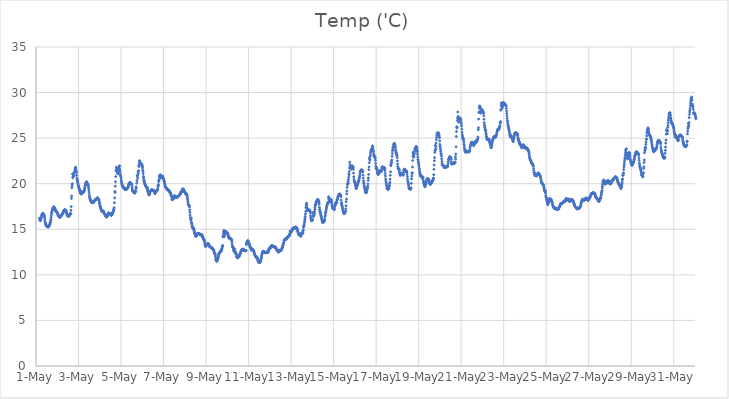
| Category | Temp ('C) |
|---|---|
| 44682.166666666664 | 16.217 |
| 44682.177083333336 | 16.087 |
| 44682.1875 | 16.053 |
| 44682.197916666664 | 15.991 |
| 44682.208333333336 | 15.937 |
| 44682.21875 | 16.111 |
| 44682.229166666664 | 16.195 |
| 44682.239583333336 | 16.241 |
| 44682.25 | 16.258 |
| 44682.260416666664 | 16.443 |
| 44682.270833333336 | 16.519 |
| 44682.28125 | 16.634 |
| 44682.291666666664 | 16.671 |
| 44682.302083333336 | 16.72 |
| 44682.3125 | 16.718 |
| 44682.322916666664 | 16.733 |
| 44682.333333333336 | 16.71 |
| 44682.34375 | 16.676 |
| 44682.354166666664 | 16.561 |
| 44682.364583333336 | 16.571 |
| 44682.375 | 16.574 |
| 44682.385416666664 | 16.514 |
| 44682.395833333336 | 16.415 |
| 44682.40625 | 16.253 |
| 44682.416666666664 | 16.048 |
| 44682.427083333336 | 15.844 |
| 44682.4375 | 15.724 |
| 44682.447916666664 | 15.62 |
| 44682.458333333336 | 15.553 |
| 44682.46875 | 15.486 |
| 44682.479166666664 | 15.424 |
| 44682.489583333336 | 15.369 |
| 44682.5 | 15.337 |
| 44682.510416666664 | 15.315 |
| 44682.520833333336 | 15.302 |
| 44682.53125 | 15.289 |
| 44682.541666666664 | 15.286 |
| 44682.552083333336 | 15.283 |
| 44682.5625 | 15.27 |
| 44682.572916666664 | 15.264 |
| 44682.583333333336 | 15.26 |
| 44682.59375 | 15.307 |
| 44682.604166666664 | 15.419 |
| 44682.614583333336 | 15.358 |
| 44682.625 | 15.433 |
| 44682.635416666664 | 15.427 |
| 44682.645833333336 | 15.54 |
| 44682.65625 | 15.694 |
| 44682.666666666664 | 15.705 |
| 44682.677083333336 | 15.765 |
| 44682.6875 | 15.944 |
| 44682.697916666664 | 16.03 |
| 44682.708333333336 | 16.25 |
| 44682.71875 | 16.477 |
| 44682.729166666664 | 16.7 |
| 44682.739583333336 | 16.812 |
| 44682.75 | 16.957 |
| 44682.760416666664 | 17.117 |
| 44682.770833333336 | 17.099 |
| 44682.78125 | 17.189 |
| 44682.791666666664 | 17.284 |
| 44682.802083333336 | 17.321 |
| 44682.8125 | 17.391 |
| 44682.822916666664 | 17.445 |
| 44682.833333333336 | 17.462 |
| 44682.84375 | 17.425 |
| 44682.854166666664 | 17.398 |
| 44682.864583333336 | 17.356 |
| 44682.875 | 17.303 |
| 44682.885416666664 | 17.277 |
| 44682.895833333336 | 17.224 |
| 44682.90625 | 17.127 |
| 44682.916666666664 | 17.076 |
| 44682.927083333336 | 17.056 |
| 44682.9375 | 17.011 |
| 44682.947916666664 | 16.98 |
| 44682.958333333336 | 16.947 |
| 44682.96875 | 16.905 |
| 44682.979166666664 | 16.879 |
| 44682.989583333336 | 16.84 |
| 44683.0 | 16.816 |
| 44683.010416666664 | 16.743 |
| 44683.020833333336 | 16.682 |
| 44683.03125 | 16.578 |
| 44683.041666666664 | 16.552 |
| 44683.052083333336 | 16.485 |
| 44683.0625 | 16.442 |
| 44683.072916666664 | 16.424 |
| 44683.083333333336 | 16.369 |
| 44683.09375 | 16.367 |
| 44683.104166666664 | 16.349 |
| 44683.114583333336 | 16.303 |
| 44683.125 | 16.312 |
| 44683.135416666664 | 16.409 |
| 44683.145833333336 | 16.38 |
| 44683.15625 | 16.522 |
| 44683.166666666664 | 16.487 |
| 44683.177083333336 | 16.527 |
| 44683.1875 | 16.458 |
| 44683.197916666664 | 16.556 |
| 44683.208333333336 | 16.577 |
| 44683.21875 | 16.623 |
| 44683.229166666664 | 16.618 |
| 44683.239583333336 | 16.644 |
| 44683.25 | 16.699 |
| 44683.260416666664 | 16.732 |
| 44683.270833333336 | 16.806 |
| 44683.28125 | 16.866 |
| 44683.291666666664 | 16.941 |
| 44683.302083333336 | 17.006 |
| 44683.3125 | 17.04 |
| 44683.322916666664 | 17.092 |
| 44683.333333333336 | 17.121 |
| 44683.34375 | 17.141 |
| 44683.354166666664 | 17.137 |
| 44683.364583333336 | 17.141 |
| 44683.375 | 17.093 |
| 44683.385416666664 | 17.061 |
| 44683.395833333336 | 17.081 |
| 44683.40625 | 17.048 |
| 44683.416666666664 | 17.006 |
| 44683.427083333336 | 16.947 |
| 44683.4375 | 16.845 |
| 44683.447916666664 | 16.719 |
| 44683.458333333336 | 16.631 |
| 44683.46875 | 16.581 |
| 44683.479166666664 | 16.523 |
| 44683.489583333336 | 16.469 |
| 44683.5 | 16.45 |
| 44683.510416666664 | 16.444 |
| 44683.520833333336 | 16.436 |
| 44683.53125 | 16.439 |
| 44683.541666666664 | 16.448 |
| 44683.552083333336 | 16.465 |
| 44683.5625 | 16.477 |
| 44683.572916666664 | 16.497 |
| 44683.583333333336 | 16.539 |
| 44683.59375 | 16.599 |
| 44683.604166666664 | 16.688 |
| 44683.614583333336 | 16.727 |
| 44683.625 | 16.702 |
| 44683.635416666664 | 16.723 |
| 44683.645833333336 | 17.082 |
| 44683.65625 | 17.487 |
| 44683.666666666664 | 18.376 |
| 44683.677083333336 | 18.644 |
| 44683.6875 | 19.553 |
| 44683.697916666664 | 19.805 |
| 44683.708333333336 | 19.993 |
| 44683.71875 | 21.07 |
| 44683.729166666664 | 20.65 |
| 44683.739583333336 | 21.065 |
| 44683.75 | 20.812 |
| 44683.760416666664 | 20.781 |
| 44683.770833333336 | 20.817 |
| 44683.78125 | 20.878 |
| 44683.791666666664 | 21.066 |
| 44683.802083333336 | 21.201 |
| 44683.8125 | 21.275 |
| 44683.822916666664 | 21.385 |
| 44683.833333333336 | 21.524 |
| 44683.84375 | 21.64 |
| 44683.854166666664 | 21.783 |
| 44683.864583333336 | 21.799 |
| 44683.875 | 21.592 |
| 44683.885416666664 | 21.466 |
| 44683.895833333336 | 21.29 |
| 44683.90625 | 21.221 |
| 44683.916666666664 | 20.902 |
| 44683.927083333336 | 20.578 |
| 44683.9375 | 20.457 |
| 44683.947916666664 | 20.353 |
| 44683.958333333336 | 20.187 |
| 44683.96875 | 20.077 |
| 44683.979166666664 | 19.957 |
| 44683.989583333336 | 19.818 |
| 44684.0 | 19.705 |
| 44684.010416666664 | 19.645 |
| 44684.020833333336 | 19.535 |
| 44684.03125 | 19.468 |
| 44684.041666666664 | 19.411 |
| 44684.052083333336 | 19.324 |
| 44684.0625 | 19.237 |
| 44684.072916666664 | 19.154 |
| 44684.083333333336 | 19.046 |
| 44684.09375 | 18.972 |
| 44684.104166666664 | 18.913 |
| 44684.114583333336 | 18.885 |
| 44684.125 | 18.877 |
| 44684.135416666664 | 18.879 |
| 44684.145833333336 | 18.977 |
| 44684.15625 | 19.132 |
| 44684.166666666664 | 19.06 |
| 44684.177083333336 | 19.061 |
| 44684.1875 | 19.089 |
| 44684.197916666664 | 19.077 |
| 44684.208333333336 | 18.993 |
| 44684.21875 | 19.036 |
| 44684.229166666664 | 19.067 |
| 44684.239583333336 | 19.109 |
| 44684.25 | 19.16 |
| 44684.260416666664 | 19.217 |
| 44684.270833333336 | 19.238 |
| 44684.28125 | 19.37 |
| 44684.291666666664 | 19.511 |
| 44684.302083333336 | 19.639 |
| 44684.3125 | 19.776 |
| 44684.322916666664 | 19.886 |
| 44684.333333333336 | 19.979 |
| 44684.34375 | 20.083 |
| 44684.354166666664 | 20.063 |
| 44684.364583333336 | 20.126 |
| 44684.375 | 20.2 |
| 44684.385416666664 | 20.198 |
| 44684.395833333336 | 20.183 |
| 44684.40625 | 20.066 |
| 44684.416666666664 | 19.972 |
| 44684.427083333336 | 19.972 |
| 44684.4375 | 19.963 |
| 44684.447916666664 | 19.902 |
| 44684.458333333336 | 19.803 |
| 44684.46875 | 19.636 |
| 44684.479166666664 | 19.439 |
| 44684.489583333336 | 19.215 |
| 44684.5 | 18.979 |
| 44684.510416666664 | 18.724 |
| 44684.520833333336 | 18.551 |
| 44684.53125 | 18.45 |
| 44684.541666666664 | 18.368 |
| 44684.552083333336 | 18.285 |
| 44684.5625 | 18.204 |
| 44684.572916666664 | 18.146 |
| 44684.583333333336 | 18.093 |
| 44684.59375 | 18.042 |
| 44684.604166666664 | 17.983 |
| 44684.614583333336 | 17.934 |
| 44684.625 | 18.015 |
| 44684.635416666664 | 18.077 |
| 44684.645833333336 | 17.945 |
| 44684.65625 | 17.937 |
| 44684.666666666664 | 17.922 |
| 44684.677083333336 | 17.95 |
| 44684.6875 | 17.912 |
| 44684.697916666664 | 17.933 |
| 44684.708333333336 | 17.986 |
| 44684.71875 | 18.021 |
| 44684.729166666664 | 18.054 |
| 44684.739583333336 | 18.102 |
| 44684.75 | 18.13 |
| 44684.760416666664 | 18.169 |
| 44684.770833333336 | 18.193 |
| 44684.78125 | 18.206 |
| 44684.791666666664 | 18.229 |
| 44684.802083333336 | 18.245 |
| 44684.8125 | 18.252 |
| 44684.822916666664 | 18.283 |
| 44684.833333333336 | 18.313 |
| 44684.84375 | 18.328 |
| 44684.854166666664 | 18.363 |
| 44684.864583333336 | 18.395 |
| 44684.875 | 18.416 |
| 44684.885416666664 | 18.468 |
| 44684.895833333336 | 18.453 |
| 44684.90625 | 18.397 |
| 44684.916666666664 | 18.323 |
| 44684.927083333336 | 18.333 |
| 44684.9375 | 18.329 |
| 44684.947916666664 | 18.264 |
| 44684.958333333336 | 18.188 |
| 44684.96875 | 18.106 |
| 44684.979166666664 | 17.971 |
| 44684.989583333336 | 17.835 |
| 44685.0 | 17.699 |
| 44685.010416666664 | 17.579 |
| 44685.020833333336 | 17.482 |
| 44685.03125 | 17.4 |
| 44685.041666666664 | 17.33 |
| 44685.052083333336 | 17.263 |
| 44685.0625 | 17.182 |
| 44685.072916666664 | 17.103 |
| 44685.083333333336 | 17.057 |
| 44685.09375 | 17.031 |
| 44685.104166666664 | 16.994 |
| 44685.114583333336 | 16.966 |
| 44685.125 | 16.965 |
| 44685.135416666664 | 16.941 |
| 44685.145833333336 | 16.937 |
| 44685.15625 | 16.929 |
| 44685.166666666664 | 16.951 |
| 44685.177083333336 | 16.999 |
| 44685.1875 | 16.879 |
| 44685.197916666664 | 16.816 |
| 44685.208333333336 | 16.747 |
| 44685.21875 | 16.685 |
| 44685.229166666664 | 16.646 |
| 44685.239583333336 | 16.652 |
| 44685.25 | 16.597 |
| 44685.260416666664 | 16.529 |
| 44685.270833333336 | 16.522 |
| 44685.28125 | 16.45 |
| 44685.291666666664 | 16.413 |
| 44685.302083333336 | 16.38 |
| 44685.3125 | 16.346 |
| 44685.322916666664 | 16.365 |
| 44685.333333333336 | 16.37 |
| 44685.34375 | 16.405 |
| 44685.354166666664 | 16.401 |
| 44685.364583333336 | 16.481 |
| 44685.375 | 16.641 |
| 44685.385416666664 | 16.697 |
| 44685.395833333336 | 16.709 |
| 44685.40625 | 16.765 |
| 44685.416666666664 | 16.778 |
| 44685.427083333336 | 16.776 |
| 44685.4375 | 16.781 |
| 44685.447916666664 | 16.732 |
| 44685.458333333336 | 16.72 |
| 44685.46875 | 16.728 |
| 44685.479166666664 | 16.713 |
| 44685.489583333336 | 16.687 |
| 44685.5 | 16.656 |
| 44685.510416666664 | 16.616 |
| 44685.520833333336 | 16.571 |
| 44685.53125 | 16.549 |
| 44685.541666666664 | 16.546 |
| 44685.552083333336 | 16.56 |
| 44685.5625 | 16.573 |
| 44685.572916666664 | 16.607 |
| 44685.583333333336 | 16.654 |
| 44685.59375 | 16.727 |
| 44685.604166666664 | 16.794 |
| 44685.614583333336 | 16.854 |
| 44685.625 | 16.919 |
| 44685.635416666664 | 16.976 |
| 44685.645833333336 | 17.071 |
| 44685.65625 | 17.207 |
| 44685.666666666664 | 17.203 |
| 44685.677083333336 | 17.373 |
| 44685.6875 | 17.909 |
| 44685.697916666664 | 18.443 |
| 44685.708333333336 | 19.143 |
| 44685.71875 | 19.042 |
| 44685.729166666664 | 19.732 |
| 44685.739583333336 | 20.216 |
| 44685.75 | 20.787 |
| 44685.760416666664 | 21.424 |
| 44685.770833333336 | 21.459 |
| 44685.78125 | 21.803 |
| 44685.791666666664 | 21.485 |
| 44685.802083333336 | 21.682 |
| 44685.8125 | 21.681 |
| 44685.822916666664 | 21.183 |
| 44685.833333333336 | 21.316 |
| 44685.84375 | 21.394 |
| 44685.854166666664 | 21.083 |
| 44685.864583333336 | 21.405 |
| 44685.875 | 21.364 |
| 44685.885416666664 | 21.637 |
| 44685.895833333336 | 21.751 |
| 44685.90625 | 21.912 |
| 44685.916666666664 | 21.898 |
| 44685.927083333336 | 21.965 |
| 44685.9375 | 21.623 |
| 44685.947916666664 | 21.411 |
| 44685.958333333336 | 21.153 |
| 44685.96875 | 20.947 |
| 44685.979166666664 | 20.88 |
| 44685.989583333336 | 20.788 |
| 44686.0 | 20.602 |
| 44686.010416666664 | 20.391 |
| 44686.020833333336 | 20.213 |
| 44686.03125 | 20.09 |
| 44686.041666666664 | 19.977 |
| 44686.052083333336 | 19.883 |
| 44686.0625 | 19.809 |
| 44686.072916666664 | 19.726 |
| 44686.083333333336 | 19.688 |
| 44686.09375 | 19.644 |
| 44686.104166666664 | 19.613 |
| 44686.114583333336 | 19.597 |
| 44686.125 | 19.573 |
| 44686.135416666664 | 19.551 |
| 44686.145833333336 | 19.518 |
| 44686.15625 | 19.422 |
| 44686.166666666664 | 19.391 |
| 44686.177083333336 | 19.374 |
| 44686.1875 | 19.354 |
| 44686.197916666664 | 19.421 |
| 44686.208333333336 | 19.389 |
| 44686.21875 | 19.45 |
| 44686.229166666664 | 19.355 |
| 44686.239583333336 | 19.375 |
| 44686.25 | 19.379 |
| 44686.260416666664 | 19.434 |
| 44686.270833333336 | 19.432 |
| 44686.28125 | 19.495 |
| 44686.291666666664 | 19.467 |
| 44686.302083333336 | 19.485 |
| 44686.3125 | 19.558 |
| 44686.322916666664 | 19.617 |
| 44686.333333333336 | 19.627 |
| 44686.34375 | 19.755 |
| 44686.354166666664 | 19.84 |
| 44686.364583333336 | 19.93 |
| 44686.375 | 19.98 |
| 44686.385416666664 | 20.069 |
| 44686.395833333336 | 20.082 |
| 44686.40625 | 20.075 |
| 44686.416666666664 | 20.088 |
| 44686.427083333336 | 20.101 |
| 44686.4375 | 20.102 |
| 44686.447916666664 | 20.093 |
| 44686.458333333336 | 20.061 |
| 44686.46875 | 19.997 |
| 44686.479166666664 | 19.985 |
| 44686.489583333336 | 19.965 |
| 44686.5 | 19.926 |
| 44686.510416666664 | 19.824 |
| 44686.520833333336 | 19.578 |
| 44686.53125 | 19.41 |
| 44686.541666666664 | 19.271 |
| 44686.552083333336 | 19.182 |
| 44686.5625 | 19.138 |
| 44686.572916666664 | 19.151 |
| 44686.583333333336 | 19.116 |
| 44686.59375 | 19.08 |
| 44686.604166666664 | 19.036 |
| 44686.614583333336 | 19.001 |
| 44686.625 | 19.007 |
| 44686.635416666664 | 18.97 |
| 44686.645833333336 | 18.976 |
| 44686.65625 | 19.019 |
| 44686.666666666664 | 19.168 |
| 44686.677083333336 | 19.181 |
| 44686.6875 | 19.138 |
| 44686.697916666664 | 19.414 |
| 44686.708333333336 | 19.659 |
| 44686.71875 | 19.553 |
| 44686.739583333336 | 20.066 |
| 44686.75 | 20.34 |
| 44686.760416666664 | 20.87 |
| 44686.770833333336 | 20.87 |
| 44686.78125 | 20.619 |
| 44686.791666666664 | 20.956 |
| 44686.802083333336 | 21.319 |
| 44686.8125 | 21.136 |
| 44686.822916666664 | 21.424 |
| 44686.833333333336 | 21.959 |
| 44686.84375 | 21.895 |
| 44686.854166666664 | 22.182 |
| 44686.864583333336 | 22.51 |
| 44686.875 | 22.516 |
| 44686.885416666664 | 22.381 |
| 44686.895833333336 | 22.26 |
| 44686.90625 | 22.284 |
| 44686.916666666664 | 22.25 |
| 44686.927083333336 | 22.252 |
| 44686.9375 | 22.22 |
| 44686.947916666664 | 22.197 |
| 44686.958333333336 | 22.138 |
| 44686.96875 | 22.093 |
| 44686.979166666664 | 22.079 |
| 44686.989583333336 | 22.009 |
| 44687.0 | 21.911 |
| 44687.010416666664 | 21.748 |
| 44687.020833333336 | 21.513 |
| 44687.03125 | 21.35 |
| 44687.041666666664 | 21.103 |
| 44687.052083333336 | 20.803 |
| 44687.0625 | 20.655 |
| 44687.072916666664 | 20.479 |
| 44687.083333333336 | 20.354 |
| 44687.09375 | 20.241 |
| 44687.104166666664 | 20.112 |
| 44687.114583333336 | 20.037 |
| 44687.125 | 19.965 |
| 44687.135416666664 | 19.885 |
| 44687.145833333336 | 19.839 |
| 44687.15625 | 19.773 |
| 44687.166666666664 | 19.721 |
| 44687.177083333336 | 19.677 |
| 44687.1875 | 19.635 |
| 44687.197916666664 | 19.625 |
| 44687.208333333336 | 19.608 |
| 44687.21875 | 19.439 |
| 44687.229166666664 | 19.614 |
| 44687.239583333336 | 19.501 |
| 44687.25 | 19.342 |
| 44687.260416666664 | 19.207 |
| 44687.270833333336 | 19.125 |
| 44687.28125 | 19.047 |
| 44687.291666666664 | 18.959 |
| 44687.302083333336 | 18.889 |
| 44687.3125 | 18.81 |
| 44687.322916666664 | 18.763 |
| 44687.333333333336 | 18.811 |
| 44687.34375 | 18.952 |
| 44687.354166666664 | 18.871 |
| 44687.364583333336 | 19.135 |
| 44687.375 | 19.135 |
| 44687.385416666664 | 19.166 |
| 44687.395833333336 | 19.182 |
| 44687.40625 | 19.219 |
| 44687.416666666664 | 19.253 |
| 44687.427083333336 | 19.319 |
| 44687.4375 | 19.335 |
| 44687.447916666664 | 19.307 |
| 44687.458333333336 | 19.295 |
| 44687.46875 | 19.312 |
| 44687.479166666664 | 19.271 |
| 44687.489583333336 | 19.304 |
| 44687.5 | 19.286 |
| 44687.510416666664 | 19.276 |
| 44687.520833333336 | 19.26 |
| 44687.53125 | 19.251 |
| 44687.541666666664 | 19.231 |
| 44687.552083333336 | 19.214 |
| 44687.5625 | 19.141 |
| 44687.572916666664 | 19.08 |
| 44687.583333333336 | 18.988 |
| 44687.59375 | 18.938 |
| 44687.604166666664 | 18.948 |
| 44687.614583333336 | 18.997 |
| 44687.625 | 19.096 |
| 44687.635416666664 | 19.128 |
| 44687.645833333336 | 19.149 |
| 44687.65625 | 19.172 |
| 44687.666666666664 | 19.222 |
| 44687.677083333336 | 19.257 |
| 44687.6875 | 19.28 |
| 44687.697916666664 | 19.302 |
| 44687.708333333336 | 19.3 |
| 44687.71875 | 19.295 |
| 44687.729166666664 | 19.467 |
| 44687.739583333336 | 19.686 |
| 44687.75 | 19.796 |
| 44687.760416666664 | 19.914 |
| 44687.770833333336 | 20.241 |
| 44687.78125 | 20.315 |
| 44687.791666666664 | 20.462 |
| 44687.802083333336 | 20.73 |
| 44687.8125 | 20.909 |
| 44687.822916666664 | 20.81 |
| 44687.833333333336 | 20.847 |
| 44687.84375 | 20.991 |
| 44687.854166666664 | 20.897 |
| 44687.864583333336 | 20.645 |
| 44687.875 | 20.743 |
| 44687.885416666664 | 20.702 |
| 44687.895833333336 | 20.779 |
| 44687.90625 | 20.781 |
| 44687.916666666664 | 20.793 |
| 44687.927083333336 | 20.824 |
| 44687.9375 | 20.834 |
| 44687.947916666664 | 20.824 |
| 44687.958333333336 | 20.736 |
| 44687.96875 | 20.693 |
| 44687.979166666664 | 20.651 |
| 44687.989583333336 | 20.575 |
| 44688.0 | 20.485 |
| 44688.010416666664 | 20.433 |
| 44688.020833333336 | 20.307 |
| 44688.03125 | 20.259 |
| 44688.041666666664 | 20.18 |
| 44688.052083333336 | 20.036 |
| 44688.0625 | 19.879 |
| 44688.072916666664 | 19.782 |
| 44688.083333333336 | 19.649 |
| 44688.09375 | 19.61 |
| 44688.104166666664 | 19.576 |
| 44688.114583333336 | 19.566 |
| 44688.125 | 19.535 |
| 44688.135416666664 | 19.498 |
| 44688.145833333336 | 19.461 |
| 44688.15625 | 19.431 |
| 44688.166666666664 | 19.396 |
| 44688.177083333336 | 19.376 |
| 44688.1875 | 19.357 |
| 44688.197916666664 | 19.337 |
| 44688.208333333336 | 19.317 |
| 44688.21875 | 19.299 |
| 44688.229166666664 | 19.298 |
| 44688.239583333336 | 19.279 |
| 44688.25 | 19.263 |
| 44688.260416666664 | 19.216 |
| 44688.270833333336 | 19.208 |
| 44688.28125 | 19.084 |
| 44688.291666666664 | 19.107 |
| 44688.302083333336 | 19.029 |
| 44688.3125 | 18.983 |
| 44688.322916666664 | 19.018 |
| 44688.333333333336 | 18.935 |
| 44688.34375 | 18.812 |
| 44688.354166666664 | 18.729 |
| 44688.364583333336 | 18.66 |
| 44688.375 | 18.677 |
| 44688.385416666664 | 18.532 |
| 44688.395833333336 | 18.272 |
| 44688.40625 | 18.249 |
| 44688.416666666664 | 18.246 |
| 44688.427083333336 | 18.413 |
| 44688.4375 | 18.325 |
| 44688.447916666664 | 18.363 |
| 44688.458333333336 | 18.391 |
| 44688.46875 | 18.467 |
| 44688.479166666664 | 18.36 |
| 44688.489583333336 | 18.564 |
| 44688.5 | 18.653 |
| 44688.510416666664 | 18.682 |
| 44688.520833333336 | 18.662 |
| 44688.53125 | 18.601 |
| 44688.541666666664 | 18.602 |
| 44688.552083333336 | 18.598 |
| 44688.5625 | 18.592 |
| 44688.572916666664 | 18.547 |
| 44688.583333333336 | 18.524 |
| 44688.59375 | 18.5 |
| 44688.604166666664 | 18.51 |
| 44688.614583333336 | 18.533 |
| 44688.625 | 18.533 |
| 44688.635416666664 | 18.558 |
| 44688.645833333336 | 18.579 |
| 44688.65625 | 18.577 |
| 44688.666666666664 | 18.575 |
| 44688.677083333336 | 18.581 |
| 44688.6875 | 18.601 |
| 44688.697916666664 | 18.634 |
| 44688.708333333336 | 18.657 |
| 44688.71875 | 18.681 |
| 44688.729166666664 | 18.711 |
| 44688.739583333336 | 18.74 |
| 44688.75 | 18.782 |
| 44688.760416666664 | 18.836 |
| 44688.770833333336 | 18.855 |
| 44688.78125 | 18.848 |
| 44688.791666666664 | 18.856 |
| 44688.802083333336 | 18.98 |
| 44688.8125 | 19.005 |
| 44688.822916666664 | 19.119 |
| 44688.833333333336 | 19.105 |
| 44688.84375 | 19.097 |
| 44688.854166666664 | 19.092 |
| 44688.864583333336 | 19.202 |
| 44688.875 | 19.217 |
| 44688.885416666664 | 19.396 |
| 44688.895833333336 | 19.385 |
| 44688.90625 | 19.378 |
| 44688.916666666664 | 19.342 |
| 44688.927083333336 | 19.417 |
| 44688.9375 | 19.391 |
| 44688.947916666664 | 19.313 |
| 44688.958333333336 | 19.25 |
| 44688.96875 | 19.213 |
| 44688.979166666664 | 19.175 |
| 44688.989583333336 | 19.087 |
| 44689.0 | 19.04 |
| 44689.010416666664 | 19.019 |
| 44689.020833333336 | 18.986 |
| 44689.03125 | 18.941 |
| 44689.041666666664 | 18.882 |
| 44689.052083333336 | 18.87 |
| 44689.0625 | 18.867 |
| 44689.072916666664 | 18.864 |
| 44689.083333333336 | 18.836 |
| 44689.09375 | 18.808 |
| 44689.104166666664 | 18.748 |
| 44689.114583333336 | 18.575 |
| 44689.125 | 18.402 |
| 44689.135416666664 | 18.231 |
| 44689.145833333336 | 18.056 |
| 44689.15625 | 17.868 |
| 44689.166666666664 | 17.732 |
| 44689.177083333336 | 17.663 |
| 44689.1875 | 17.664 |
| 44689.197916666664 | 17.625 |
| 44689.208333333336 | 17.56 |
| 44689.21875 | 17.45 |
| 44689.229166666664 | 17.123 |
| 44689.239583333336 | 16.854 |
| 44689.25 | 16.565 |
| 44689.260416666664 | 16.295 |
| 44689.270833333336 | 16.049 |
| 44689.28125 | 16.064 |
| 44689.291666666664 | 16.246 |
| 44689.302083333336 | 16.194 |
| 44689.3125 | 15.788 |
| 44689.322916666664 | 15.665 |
| 44689.333333333336 | 15.548 |
| 44689.34375 | 15.357 |
| 44689.354166666664 | 15.328 |
| 44689.364583333336 | 15.221 |
| 44689.375 | 15.161 |
| 44689.385416666664 | 15.119 |
| 44689.395833333336 | 15.099 |
| 44689.40625 | 15.147 |
| 44689.416666666664 | 15.105 |
| 44689.427083333336 | 15.02 |
| 44689.4375 | 14.873 |
| 44689.447916666664 | 14.745 |
| 44689.458333333336 | 14.648 |
| 44689.46875 | 14.533 |
| 44689.479166666664 | 14.428 |
| 44689.489583333336 | 14.385 |
| 44689.5 | 14.317 |
| 44689.510416666664 | 14.228 |
| 44689.520833333336 | 14.272 |
| 44689.53125 | 14.276 |
| 44689.541666666664 | 14.376 |
| 44689.552083333336 | 14.27 |
| 44689.5625 | 14.456 |
| 44689.572916666664 | 14.464 |
| 44689.583333333336 | 14.518 |
| 44689.59375 | 14.505 |
| 44689.604166666664 | 14.493 |
| 44689.614583333336 | 14.538 |
| 44689.625 | 14.523 |
| 44689.635416666664 | 14.553 |
| 44689.645833333336 | 14.542 |
| 44689.65625 | 14.556 |
| 44689.666666666664 | 14.515 |
| 44689.677083333336 | 14.467 |
| 44689.6875 | 14.465 |
| 44689.697916666664 | 14.467 |
| 44689.708333333336 | 14.448 |
| 44689.71875 | 14.465 |
| 44689.729166666664 | 14.456 |
| 44689.739583333336 | 14.409 |
| 44689.75 | 14.378 |
| 44689.760416666664 | 14.386 |
| 44689.770833333336 | 14.4 |
| 44689.78125 | 14.42 |
| 44689.791666666664 | 14.413 |
| 44689.802083333336 | 14.397 |
| 44689.8125 | 14.329 |
| 44689.822916666664 | 14.284 |
| 44689.833333333336 | 14.137 |
| 44689.84375 | 14.148 |
| 44689.854166666664 | 14.117 |
| 44689.864583333336 | 13.988 |
| 44689.875 | 13.891 |
| 44689.885416666664 | 13.902 |
| 44689.895833333336 | 13.866 |
| 44689.90625 | 13.816 |
| 44689.916666666664 | 13.812 |
| 44689.927083333336 | 13.693 |
| 44689.9375 | 13.55 |
| 44689.947916666664 | 13.336 |
| 44689.958333333336 | 13.293 |
| 44689.96875 | 13.199 |
| 44689.979166666664 | 13.108 |
| 44689.989583333336 | 13.135 |
| 44690.0 | 13.267 |
| 44690.010416666664 | 13.214 |
| 44690.020833333336 | 13.257 |
| 44690.03125 | 13.282 |
| 44690.041666666664 | 13.278 |
| 44690.052083333336 | 13.395 |
| 44690.0625 | 13.359 |
| 44690.072916666664 | 13.397 |
| 44690.083333333336 | 13.405 |
| 44690.09375 | 13.422 |
| 44690.104166666664 | 13.418 |
| 44690.114583333336 | 13.42 |
| 44690.125 | 13.38 |
| 44690.135416666664 | 13.332 |
| 44690.145833333336 | 13.236 |
| 44690.15625 | 13.169 |
| 44690.166666666664 | 13.116 |
| 44690.177083333336 | 13.066 |
| 44690.1875 | 13.043 |
| 44690.197916666664 | 13.105 |
| 44690.208333333336 | 13.083 |
| 44690.21875 | 13.04 |
| 44690.229166666664 | 13.019 |
| 44690.239583333336 | 13.019 |
| 44690.25 | 13.011 |
| 44690.260416666664 | 12.98 |
| 44690.270833333336 | 12.957 |
| 44690.28125 | 12.933 |
| 44690.291666666664 | 12.906 |
| 44690.302083333336 | 12.88 |
| 44690.3125 | 12.81 |
| 44690.322916666664 | 12.802 |
| 44690.333333333336 | 12.833 |
| 44690.34375 | 12.784 |
| 44690.354166666664 | 12.692 |
| 44690.364583333336 | 12.632 |
| 44690.375 | 12.595 |
| 44690.385416666664 | 12.426 |
| 44690.395833333336 | 12.368 |
| 44690.40625 | 12.362 |
| 44690.416666666664 | 12.306 |
| 44690.427083333336 | 12.239 |
| 44690.4375 | 12.088 |
| 44690.447916666664 | 11.932 |
| 44690.458333333336 | 11.731 |
| 44690.46875 | 11.631 |
| 44690.479166666664 | 11.578 |
| 44690.489583333336 | 11.609 |
| 44690.5 | 11.462 |
| 44690.510416666664 | 11.612 |
| 44690.520833333336 | 11.566 |
| 44690.53125 | 11.604 |
| 44690.541666666664 | 11.634 |
| 44690.552083333336 | 11.798 |
| 44690.5625 | 11.849 |
| 44690.572916666664 | 11.94 |
| 44690.583333333336 | 12.077 |
| 44690.59375 | 12.24 |
| 44690.604166666664 | 12.309 |
| 44690.614583333336 | 12.366 |
| 44690.625 | 12.418 |
| 44690.635416666664 | 12.442 |
| 44690.645833333336 | 12.475 |
| 44690.65625 | 12.465 |
| 44690.666666666664 | 12.498 |
| 44690.677083333336 | 12.563 |
| 44690.6875 | 12.594 |
| 44690.697916666664 | 12.577 |
| 44690.708333333336 | 12.607 |
| 44690.71875 | 12.661 |
| 44690.729166666664 | 12.783 |
| 44690.739583333336 | 12.838 |
| 44690.75 | 12.93 |
| 44690.760416666664 | 13.053 |
| 44690.770833333336 | 13.163 |
| 44690.78125 | 13.224 |
| 44690.791666666664 | 14.172 |
| 44690.802083333336 | 14.177 |
| 44690.8125 | 14.365 |
| 44690.822916666664 | 14.589 |
| 44690.833333333336 | 14.767 |
| 44690.84375 | 14.857 |
| 44690.854166666664 | 14.825 |
| 44690.864583333336 | 14.212 |
| 44690.875 | 14.586 |
| 44690.885416666664 | 14.442 |
| 44690.895833333336 | 14.612 |
| 44690.90625 | 14.711 |
| 44690.916666666664 | 14.769 |
| 44690.927083333336 | 14.744 |
| 44690.9375 | 14.734 |
| 44690.947916666664 | 14.693 |
| 44690.958333333336 | 14.651 |
| 44690.96875 | 14.652 |
| 44690.979166666664 | 14.569 |
| 44690.989583333336 | 14.623 |
| 44691.0 | 14.589 |
| 44691.010416666664 | 14.571 |
| 44691.020833333336 | 14.524 |
| 44691.03125 | 14.405 |
| 44691.041666666664 | 14.281 |
| 44691.052083333336 | 14.265 |
| 44691.0625 | 14.087 |
| 44691.072916666664 | 14.087 |
| 44691.083333333336 | 14.174 |
| 44691.09375 | 14.022 |
| 44691.104166666664 | 14.01 |
| 44691.114583333336 | 13.967 |
| 44691.125 | 13.961 |
| 44691.135416666664 | 13.991 |
| 44691.145833333336 | 13.963 |
| 44691.15625 | 13.934 |
| 44691.166666666664 | 13.931 |
| 44691.177083333336 | 13.929 |
| 44691.1875 | 13.895 |
| 44691.197916666664 | 13.862 |
| 44691.208333333336 | 13.77 |
| 44691.21875 | 13.554 |
| 44691.229166666664 | 13.308 |
| 44691.239583333336 | 13.079 |
| 44691.25 | 13.087 |
| 44691.260416666664 | 13.081 |
| 44691.270833333336 | 13.012 |
| 44691.28125 | 12.918 |
| 44691.291666666664 | 12.815 |
| 44691.302083333336 | 12.7 |
| 44691.3125 | 12.645 |
| 44691.322916666664 | 12.552 |
| 44691.333333333336 | 12.515 |
| 44691.34375 | 12.866 |
| 44691.354166666664 | 12.573 |
| 44691.364583333336 | 12.655 |
| 44691.375 | 12.493 |
| 44691.385416666664 | 12.337 |
| 44691.395833333336 | 12.403 |
| 44691.40625 | 12.358 |
| 44691.416666666664 | 12.341 |
| 44691.427083333336 | 12.207 |
| 44691.4375 | 12.006 |
| 44691.447916666664 | 11.976 |
| 44691.458333333336 | 11.89 |
| 44691.46875 | 12.008 |
| 44691.479166666664 | 11.915 |
| 44691.489583333336 | 11.85 |
| 44691.5 | 11.906 |
| 44691.510416666664 | 11.918 |
| 44691.520833333336 | 11.941 |
| 44691.53125 | 11.972 |
| 44691.541666666664 | 11.984 |
| 44691.552083333336 | 12.022 |
| 44691.5625 | 12.077 |
| 44691.572916666664 | 12.154 |
| 44691.583333333336 | 12.216 |
| 44691.59375 | 12.257 |
| 44691.604166666664 | 12.326 |
| 44691.614583333336 | 12.404 |
| 44691.625 | 12.472 |
| 44691.635416666664 | 12.522 |
| 44691.645833333336 | 12.605 |
| 44691.65625 | 12.645 |
| 44691.666666666664 | 12.722 |
| 44691.677083333336 | 12.765 |
| 44691.6875 | 12.763 |
| 44691.697916666664 | 12.814 |
| 44691.708333333336 | 12.75 |
| 44691.71875 | 12.773 |
| 44691.729166666664 | 12.784 |
| 44691.739583333336 | 12.794 |
| 44691.75 | 12.814 |
| 44691.760416666664 | 12.806 |
| 44691.770833333336 | 12.737 |
| 44691.78125 | 12.668 |
| 44691.791666666664 | 12.664 |
| 44691.802083333336 | 12.684 |
| 44691.8125 | 12.672 |
| 44691.822916666664 | 12.66 |
| 44691.833333333336 | 12.679 |
| 44691.84375 | 12.672 |
| 44691.854166666664 | 12.652 |
| 44691.864583333336 | 12.66 |
| 44691.875 | 12.671 |
| 44691.885416666664 | 12.671 |
| 44691.895833333336 | 13.308 |
| 44691.90625 | 13.448 |
| 44691.916666666664 | 13.525 |
| 44691.927083333336 | 13.597 |
| 44691.9375 | 13.632 |
| 44691.947916666664 | 13.692 |
| 44691.958333333336 | 13.754 |
| 44691.96875 | 13.739 |
| 44691.979166666664 | 13.526 |
| 44691.989583333336 | 13.663 |
| 44692.0 | 13.422 |
| 44692.010416666664 | 13.426 |
| 44692.020833333336 | 13.407 |
| 44692.03125 | 13.355 |
| 44692.041666666664 | 13.377 |
| 44692.052083333336 | 13.177 |
| 44692.0625 | 13.091 |
| 44692.072916666664 | 13.059 |
| 44692.083333333336 | 12.958 |
| 44692.09375 | 13.011 |
| 44692.104166666664 | 12.998 |
| 44692.114583333336 | 12.886 |
| 44692.125 | 12.846 |
| 44692.135416666664 | 12.749 |
| 44692.145833333336 | 12.771 |
| 44692.15625 | 12.694 |
| 44692.166666666664 | 12.801 |
| 44692.177083333336 | 12.813 |
| 44692.1875 | 12.769 |
| 44692.197916666664 | 12.74 |
| 44692.208333333336 | 12.747 |
| 44692.21875 | 12.716 |
| 44692.229166666664 | 12.684 |
| 44692.239583333336 | 12.639 |
| 44692.25 | 12.586 |
| 44692.260416666664 | 12.448 |
| 44692.270833333336 | 12.38 |
| 44692.28125 | 12.261 |
| 44692.291666666664 | 12.209 |
| 44692.302083333336 | 12.156 |
| 44692.3125 | 12.085 |
| 44692.322916666664 | 12.052 |
| 44692.333333333336 | 12.013 |
| 44692.34375 | 11.981 |
| 44692.354166666664 | 11.951 |
| 44692.364583333336 | 11.908 |
| 44692.375 | 11.874 |
| 44692.385416666664 | 11.98 |
| 44692.395833333336 | 11.915 |
| 44692.40625 | 11.889 |
| 44692.416666666664 | 11.794 |
| 44692.427083333336 | 11.682 |
| 44692.4375 | 11.561 |
| 44692.447916666664 | 11.505 |
| 44692.458333333336 | 11.405 |
| 44692.46875 | 11.494 |
| 44692.479166666664 | 11.492 |
| 44692.489583333336 | 11.382 |
| 44692.5 | 11.361 |
| 44692.510416666664 | 11.507 |
| 44692.520833333336 | 11.518 |
| 44692.53125 | 11.343 |
| 44692.541666666664 | 11.389 |
| 44692.552083333336 | 11.459 |
| 44692.5625 | 11.53 |
| 44692.572916666664 | 11.595 |
| 44692.583333333336 | 11.717 |
| 44692.59375 | 11.819 |
| 44692.604166666664 | 11.925 |
| 44692.614583333336 | 12.062 |
| 44692.625 | 12.18 |
| 44692.635416666664 | 12.303 |
| 44692.645833333336 | 12.363 |
| 44692.65625 | 12.484 |
| 44692.666666666664 | 12.52 |
| 44692.677083333336 | 12.569 |
| 44692.6875 | 12.486 |
| 44692.697916666664 | 12.547 |
| 44692.708333333336 | 12.584 |
| 44692.71875 | 12.523 |
| 44692.729166666664 | 12.514 |
| 44692.739583333336 | 12.511 |
| 44692.75 | 12.499 |
| 44692.760416666664 | 12.458 |
| 44692.770833333336 | 12.461 |
| 44692.78125 | 12.452 |
| 44692.791666666664 | 12.43 |
| 44692.802083333336 | 12.431 |
| 44692.8125 | 12.447 |
| 44692.822916666664 | 12.46 |
| 44692.833333333336 | 12.481 |
| 44692.84375 | 12.493 |
| 44692.854166666664 | 12.494 |
| 44692.864583333336 | 12.489 |
| 44692.875 | 12.485 |
| 44692.885416666664 | 12.487 |
| 44692.895833333336 | 12.488 |
| 44692.90625 | 12.489 |
| 44692.916666666664 | 12.483 |
| 44692.927083333336 | 12.49 |
| 44692.9375 | 12.641 |
| 44692.947916666664 | 12.728 |
| 44692.958333333336 | 12.793 |
| 44692.96875 | 12.896 |
| 44692.979166666664 | 12.886 |
| 44692.989583333336 | 12.91 |
| 44693.0 | 12.926 |
| 44693.010416666664 | 12.912 |
| 44693.020833333336 | 12.983 |
| 44693.03125 | 13.024 |
| 44693.041666666664 | 13.045 |
| 44693.052083333336 | 13.041 |
| 44693.0625 | 13.173 |
| 44693.072916666664 | 13.181 |
| 44693.083333333336 | 13.183 |
| 44693.09375 | 13.175 |
| 44693.104166666664 | 13.197 |
| 44693.114583333336 | 13.172 |
| 44693.125 | 13.192 |
| 44693.135416666664 | 13.181 |
| 44693.145833333336 | 13.163 |
| 44693.15625 | 13.144 |
| 44693.166666666664 | 13.105 |
| 44693.177083333336 | 13.084 |
| 44693.1875 | 13.078 |
| 44693.197916666664 | 13.073 |
| 44693.208333333336 | 13.078 |
| 44693.21875 | 13.077 |
| 44693.229166666664 | 13.068 |
| 44693.239583333336 | 13.061 |
| 44693.25 | 13.049 |
| 44693.260416666664 | 13.034 |
| 44693.270833333336 | 13.015 |
| 44693.28125 | 12.978 |
| 44693.291666666664 | 12.898 |
| 44693.302083333336 | 12.834 |
| 44693.3125 | 12.792 |
| 44693.322916666664 | 12.752 |
| 44693.333333333336 | 12.693 |
| 44693.34375 | 12.675 |
| 44693.354166666664 | 12.643 |
| 44693.364583333336 | 12.622 |
| 44693.375 | 12.588 |
| 44693.385416666664 | 12.538 |
| 44693.395833333336 | 12.502 |
| 44693.40625 | 12.483 |
| 44693.416666666664 | 12.577 |
| 44693.427083333336 | 12.69 |
| 44693.4375 | 12.723 |
| 44693.447916666664 | 12.661 |
| 44693.458333333336 | 12.674 |
| 44693.46875 | 12.631 |
| 44693.479166666664 | 12.671 |
| 44693.489583333336 | 12.655 |
| 44693.5 | 12.649 |
| 44693.510416666664 | 12.661 |
| 44693.520833333336 | 12.689 |
| 44693.53125 | 12.72 |
| 44693.541666666664 | 12.725 |
| 44693.552083333336 | 12.747 |
| 44693.5625 | 12.852 |
| 44693.572916666664 | 12.891 |
| 44693.583333333336 | 13.003 |
| 44693.59375 | 13.065 |
| 44693.604166666664 | 13.172 |
| 44693.614583333336 | 13.21 |
| 44693.625 | 13.287 |
| 44693.635416666664 | 13.39 |
| 44693.645833333336 | 13.464 |
| 44693.65625 | 13.544 |
| 44693.666666666664 | 13.732 |
| 44693.677083333336 | 13.785 |
| 44693.6875 | 13.831 |
| 44693.697916666664 | 13.887 |
| 44693.708333333336 | 13.855 |
| 44693.71875 | 13.884 |
| 44693.729166666664 | 13.962 |
| 44693.739583333336 | 13.965 |
| 44693.75 | 13.895 |
| 44693.760416666664 | 13.935 |
| 44693.770833333336 | 13.931 |
| 44693.78125 | 13.942 |
| 44693.791666666664 | 13.971 |
| 44693.802083333336 | 14.02 |
| 44693.8125 | 14.058 |
| 44693.822916666664 | 14.094 |
| 44693.833333333336 | 14.115 |
| 44693.84375 | 14.164 |
| 44693.854166666664 | 14.194 |
| 44693.864583333336 | 14.21 |
| 44693.875 | 14.239 |
| 44693.885416666664 | 14.25 |
| 44693.895833333336 | 14.251 |
| 44693.90625 | 14.254 |
| 44693.916666666664 | 14.339 |
| 44693.927083333336 | 14.349 |
| 44693.9375 | 14.539 |
| 44693.947916666664 | 14.79 |
| 44693.958333333336 | 14.569 |
| 44693.96875 | 14.571 |
| 44693.979166666664 | 14.816 |
| 44693.989583333336 | 14.678 |
| 44694.0 | 14.765 |
| 44694.010416666664 | 14.733 |
| 44694.020833333336 | 14.802 |
| 44694.03125 | 14.83 |
| 44694.041666666664 | 14.906 |
| 44694.052083333336 | 14.947 |
| 44694.0625 | 14.955 |
| 44694.072916666664 | 15.05 |
| 44694.083333333336 | 15.134 |
| 44694.09375 | 15.092 |
| 44694.104166666664 | 15.087 |
| 44694.114583333336 | 15.077 |
| 44694.125 | 15.122 |
| 44694.135416666664 | 15.155 |
| 44694.145833333336 | 15.149 |
| 44694.15625 | 15.138 |
| 44694.166666666664 | 15.139 |
| 44694.177083333336 | 15.104 |
| 44694.1875 | 15.145 |
| 44694.197916666664 | 15.211 |
| 44694.208333333336 | 15.23 |
| 44694.21875 | 15.239 |
| 44694.229166666664 | 15.25 |
| 44694.239583333336 | 15.2 |
| 44694.25 | 15.172 |
| 44694.260416666664 | 15.167 |
| 44694.270833333336 | 15.13 |
| 44694.28125 | 15.056 |
| 44694.291666666664 | 15.017 |
| 44694.302083333336 | 14.879 |
| 44694.3125 | 14.75 |
| 44694.322916666664 | 14.698 |
| 44694.333333333336 | 14.628 |
| 44694.34375 | 14.533 |
| 44694.354166666664 | 14.46 |
| 44694.364583333336 | 14.423 |
| 44694.375 | 14.398 |
| 44694.385416666664 | 14.373 |
| 44694.395833333336 | 14.344 |
| 44694.40625 | 14.343 |
| 44694.416666666664 | 14.34 |
| 44694.427083333336 | 14.327 |
| 44694.4375 | 14.3 |
| 44694.447916666664 | 14.291 |
| 44694.458333333336 | 14.265 |
| 44694.46875 | 14.243 |
| 44694.479166666664 | 14.544 |
| 44694.489583333336 | 14.545 |
| 44694.5 | 14.623 |
| 44694.510416666664 | 14.548 |
| 44694.520833333336 | 14.549 |
| 44694.53125 | 14.558 |
| 44694.541666666664 | 14.521 |
| 44694.552083333336 | 14.644 |
| 44694.5625 | 14.833 |
| 44694.572916666664 | 14.917 |
| 44694.583333333336 | 15.204 |
| 44694.59375 | 15.341 |
| 44694.604166666664 | 15.391 |
| 44694.614583333336 | 15.475 |
| 44694.625 | 15.694 |
| 44694.635416666664 | 15.84 |
| 44694.645833333336 | 16 |
| 44694.65625 | 16.179 |
| 44694.666666666664 | 16.414 |
| 44694.677083333336 | 16.682 |
| 44694.6875 | 16.957 |
| 44694.697916666664 | 17.387 |
| 44694.708333333336 | 17.663 |
| 44694.71875 | 17.763 |
| 44694.729166666664 | 17.861 |
| 44694.739583333336 | 17.57 |
| 44694.75 | 17.351 |
| 44694.760416666664 | 17.186 |
| 44694.770833333336 | 17.197 |
| 44694.78125 | 17.149 |
| 44694.791666666664 | 17.061 |
| 44694.802083333336 | 17.085 |
| 44694.8125 | 17.124 |
| 44694.822916666664 | 17.11 |
| 44694.833333333336 | 17.118 |
| 44694.84375 | 17.118 |
| 44694.854166666664 | 17.074 |
| 44694.864583333336 | 17.062 |
| 44694.875 | 17.07 |
| 44694.885416666664 | 17.032 |
| 44694.895833333336 | 16.962 |
| 44694.90625 | 16.785 |
| 44694.916666666664 | 16.482 |
| 44694.927083333336 | 16.284 |
| 44694.9375 | 16.137 |
| 44694.947916666664 | 16.066 |
| 44694.958333333336 | 15.95 |
| 44694.96875 | 15.935 |
| 44694.979166666664 | 15.948 |
| 44694.989583333336 | 15.953 |
| 44695.0 | 15.973 |
| 44695.010416666664 | 16.097 |
| 44695.020833333336 | 16.771 |
| 44695.03125 | 16.838 |
| 44695.041666666664 | 16.43 |
| 44695.052083333336 | 16.518 |
| 44695.0625 | 16.429 |
| 44695.072916666664 | 16.532 |
| 44695.083333333336 | 16.655 |
| 44695.09375 | 16.714 |
| 44695.104166666664 | 16.937 |
| 44695.114583333336 | 17.164 |
| 44695.125 | 17.368 |
| 44695.135416666664 | 17.606 |
| 44695.145833333336 | 17.642 |
| 44695.15625 | 17.716 |
| 44695.166666666664 | 17.842 |
| 44695.177083333336 | 17.924 |
| 44695.1875 | 18.012 |
| 44695.197916666664 | 18.046 |
| 44695.208333333336 | 18.064 |
| 44695.21875 | 18.113 |
| 44695.229166666664 | 18.215 |
| 44695.239583333336 | 18.267 |
| 44695.25 | 18.272 |
| 44695.260416666664 | 18.244 |
| 44695.270833333336 | 18.188 |
| 44695.28125 | 18.159 |
| 44695.291666666664 | 18.124 |
| 44695.302083333336 | 18.059 |
| 44695.3125 | 17.964 |
| 44695.322916666664 | 17.751 |
| 44695.333333333336 | 17.408 |
| 44695.34375 | 17.193 |
| 44695.354166666664 | 17.061 |
| 44695.364583333336 | 16.927 |
| 44695.375 | 16.867 |
| 44695.385416666664 | 16.715 |
| 44695.395833333336 | 16.59 |
| 44695.40625 | 16.503 |
| 44695.416666666664 | 16.386 |
| 44695.427083333336 | 16.276 |
| 44695.4375 | 16.159 |
| 44695.447916666664 | 16.024 |
| 44695.458333333336 | 15.921 |
| 44695.46875 | 15.805 |
| 44695.479166666664 | 15.772 |
| 44695.489583333336 | 15.739 |
| 44695.5 | 15.713 |
| 44695.510416666664 | 15.961 |
| 44695.520833333336 | 16.008 |
| 44695.53125 | 15.85 |
| 44695.541666666664 | 15.944 |
| 44695.552083333336 | 15.894 |
| 44695.5625 | 15.916 |
| 44695.572916666664 | 15.937 |
| 44695.583333333336 | 16.072 |
| 44695.59375 | 16.363 |
| 44695.604166666664 | 16.496 |
| 44695.614583333336 | 16.716 |
| 44695.625 | 16.873 |
| 44695.635416666664 | 16.979 |
| 44695.645833333336 | 17.111 |
| 44695.65625 | 17.243 |
| 44695.666666666664 | 17.398 |
| 44695.677083333336 | 17.467 |
| 44695.6875 | 17.586 |
| 44695.697916666664 | 17.665 |
| 44695.708333333336 | 17.778 |
| 44695.71875 | 17.862 |
| 44695.729166666664 | 17.881 |
| 44695.739583333336 | 17.932 |
| 44695.75 | 17.993 |
| 44695.760416666664 | 18.574 |
| 44695.770833333336 | 18.421 |
| 44695.78125 | 18.29 |
| 44695.791666666664 | 18.296 |
| 44695.802083333336 | 18.253 |
| 44695.8125 | 18.102 |
| 44695.822916666664 | 17.998 |
| 44695.833333333336 | 18.138 |
| 44695.84375 | 18.308 |
| 44695.854166666664 | 18.288 |
| 44695.864583333336 | 18.277 |
| 44695.875 | 18.276 |
| 44695.885416666664 | 18.215 |
| 44695.895833333336 | 18.139 |
| 44695.90625 | 17.973 |
| 44695.916666666664 | 17.764 |
| 44695.927083333336 | 17.561 |
| 44695.9375 | 17.468 |
| 44695.947916666664 | 17.348 |
| 44695.958333333336 | 17.306 |
| 44695.96875 | 17.278 |
| 44695.979166666664 | 17.277 |
| 44695.989583333336 | 17.27 |
| 44696.0 | 17.254 |
| 44696.010416666664 | 17.232 |
| 44696.020833333336 | 17.199 |
| 44696.03125 | 17.168 |
| 44696.041666666664 | 17.191 |
| 44696.052083333336 | 17.464 |
| 44696.0625 | 17.678 |
| 44696.072916666664 | 17.595 |
| 44696.083333333336 | 17.682 |
| 44696.09375 | 17.835 |
| 44696.104166666664 | 17.903 |
| 44696.114583333336 | 17.934 |
| 44696.125 | 17.857 |
| 44696.135416666664 | 17.89 |
| 44696.145833333336 | 17.981 |
| 44696.15625 | 18.119 |
| 44696.166666666664 | 18.249 |
| 44696.177083333336 | 18.286 |
| 44696.1875 | 18.386 |
| 44696.197916666664 | 18.428 |
| 44696.208333333336 | 18.581 |
| 44696.21875 | 18.618 |
| 44696.229166666664 | 18.699 |
| 44696.239583333336 | 18.743 |
| 44696.25 | 18.791 |
| 44696.260416666664 | 18.794 |
| 44696.270833333336 | 18.833 |
| 44696.28125 | 18.87 |
| 44696.291666666664 | 18.878 |
| 44696.302083333336 | 18.797 |
| 44696.3125 | 18.768 |
| 44696.322916666664 | 18.749 |
| 44696.333333333336 | 18.704 |
| 44696.34375 | 18.573 |
| 44696.354166666664 | 18.205 |
| 44696.364583333336 | 17.93 |
| 44696.375 | 17.81 |
| 44696.385416666664 | 17.678 |
| 44696.395833333336 | 17.59 |
| 44696.40625 | 17.49 |
| 44696.416666666664 | 17.341 |
| 44696.427083333336 | 17.25 |
| 44696.4375 | 17.099 |
| 44696.447916666664 | 16.97 |
| 44696.458333333336 | 16.897 |
| 44696.46875 | 16.829 |
| 44696.479166666664 | 16.761 |
| 44696.489583333336 | 16.728 |
| 44696.5 | 16.715 |
| 44696.510416666664 | 16.726 |
| 44696.520833333336 | 16.775 |
| 44696.53125 | 16.818 |
| 44696.541666666664 | 16.908 |
| 44696.552083333336 | 16.935 |
| 44696.5625 | 17.003 |
| 44696.572916666664 | 17.256 |
| 44696.583333333336 | 17.579 |
| 44696.59375 | 18.03 |
| 44696.604166666664 | 18.313 |
| 44696.614583333336 | 18.888 |
| 44696.625 | 19.194 |
| 44696.635416666664 | 19.59 |
| 44696.645833333336 | 19.966 |
| 44696.65625 | 19.9 |
| 44696.666666666664 | 20.001 |
| 44696.677083333336 | 20.257 |
| 44696.6875 | 20.068 |
| 44696.697916666664 | 20.47 |
| 44696.708333333336 | 20.714 |
| 44696.71875 | 21.099 |
| 44696.729166666664 | 20.967 |
| 44696.739583333336 | 21.341 |
| 44696.75 | 21.724 |
| 44696.760416666664 | 22.354 |
| 44696.770833333336 | 22.062 |
| 44696.78125 | 21.929 |
| 44696.791666666664 | 22.01 |
| 44696.802083333336 | 21.885 |
| 44696.8125 | 21.691 |
| 44696.822916666664 | 21.621 |
| 44696.833333333336 | 21.6 |
| 44696.84375 | 21.673 |
| 44696.854166666664 | 21.716 |
| 44696.864583333336 | 21.857 |
| 44696.875 | 21.894 |
| 44696.885416666664 | 21.935 |
| 44696.895833333336 | 21.928 |
| 44696.90625 | 21.889 |
| 44696.916666666664 | 21.758 |
| 44696.927083333336 | 21.577 |
| 44696.9375 | 21.163 |
| 44696.947916666664 | 20.769 |
| 44696.958333333336 | 20.506 |
| 44696.96875 | 20.32 |
| 44696.979166666664 | 20.222 |
| 44696.989583333336 | 20.199 |
| 44697.0 | 20.167 |
| 44697.010416666664 | 20.075 |
| 44697.020833333336 | 19.975 |
| 44697.03125 | 19.783 |
| 44697.041666666664 | 19.68 |
| 44697.052083333336 | 19.534 |
| 44697.0625 | 19.457 |
| 44697.072916666664 | 19.53 |
| 44697.083333333336 | 19.689 |
| 44697.09375 | 19.722 |
| 44697.104166666664 | 19.783 |
| 44697.114583333336 | 19.913 |
| 44697.125 | 19.896 |
| 44697.135416666664 | 19.985 |
| 44697.145833333336 | 20.105 |
| 44697.15625 | 20.195 |
| 44697.166666666664 | 20.247 |
| 44697.177083333336 | 20.355 |
| 44697.1875 | 20.388 |
| 44697.197916666664 | 20.538 |
| 44697.208333333336 | 20.635 |
| 44697.21875 | 20.747 |
| 44697.229166666664 | 20.882 |
| 44697.239583333336 | 21.073 |
| 44697.25 | 21.255 |
| 44697.260416666664 | 21.371 |
| 44697.270833333336 | 21.393 |
| 44697.28125 | 21.466 |
| 44697.291666666664 | 21.485 |
| 44697.302083333336 | 21.514 |
| 44697.3125 | 21.525 |
| 44697.322916666664 | 21.536 |
| 44697.333333333336 | 21.473 |
| 44697.34375 | 21.433 |
| 44697.354166666664 | 21.437 |
| 44697.364583333336 | 21.385 |
| 44697.375 | 21.289 |
| 44697.385416666664 | 20.954 |
| 44697.395833333336 | 20.63 |
| 44697.40625 | 20.325 |
| 44697.416666666664 | 20.147 |
| 44697.427083333336 | 20 |
| 44697.4375 | 19.81 |
| 44697.447916666664 | 19.677 |
| 44697.458333333336 | 19.544 |
| 44697.46875 | 19.384 |
| 44697.479166666664 | 19.28 |
| 44697.489583333336 | 19.179 |
| 44697.5 | 19.081 |
| 44697.510416666664 | 19.015 |
| 44697.520833333336 | 19 |
| 44697.53125 | 19.01 |
| 44697.541666666664 | 19.051 |
| 44697.552083333336 | 19.121 |
| 44697.5625 | 19.198 |
| 44697.572916666664 | 19.36 |
| 44697.583333333336 | 19.44 |
| 44697.59375 | 19.578 |
| 44697.604166666664 | 19.708 |
| 44697.614583333336 | 19.971 |
| 44697.625 | 20.369 |
| 44697.635416666664 | 20.634 |
| 44697.645833333336 | 21.023 |
| 44697.65625 | 21.537 |
| 44697.666666666664 | 21.843 |
| 44697.677083333336 | 22.313 |
| 44697.6875 | 22.811 |
| 44697.697916666664 | 22.666 |
| 44697.708333333336 | 22.6 |
| 44697.71875 | 22.993 |
| 44697.729166666664 | 23.155 |
| 44697.739583333336 | 23.403 |
| 44697.75 | 23.567 |
| 44697.760416666664 | 23.719 |
| 44697.770833333336 | 23.742 |
| 44697.78125 | 23.701 |
| 44697.791666666664 | 23.654 |
| 44697.802083333336 | 23.745 |
| 44697.8125 | 23.9 |
| 44697.822916666664 | 24.121 |
| 44697.833333333336 | 24.139 |
| 44697.84375 | 23.957 |
| 44697.854166666664 | 23.769 |
| 44697.864583333336 | 23.658 |
| 44697.875 | 23.515 |
| 44697.885416666664 | 23.269 |
| 44697.895833333336 | 23.116 |
| 44697.90625 | 23.05 |
| 44697.916666666664 | 22.988 |
| 44697.927083333336 | 22.936 |
| 44697.9375 | 22.935 |
| 44697.947916666664 | 22.9 |
| 44697.958333333336 | 22.777 |
| 44697.96875 | 22.56 |
| 44697.979166666664 | 22.231 |
| 44697.989583333336 | 21.915 |
| 44698.0 | 21.709 |
| 44698.010416666664 | 21.667 |
| 44698.020833333336 | 21.711 |
| 44698.03125 | 21.685 |
| 44698.041666666664 | 21.549 |
| 44698.052083333336 | 21.404 |
| 44698.0625 | 21.262 |
| 44698.072916666664 | 21.142 |
| 44698.083333333336 | 21.09 |
| 44698.09375 | 21.043 |
| 44698.104166666664 | 21.007 |
| 44698.114583333336 | 21.242 |
| 44698.125 | 21.145 |
| 44698.135416666664 | 21.196 |
| 44698.145833333336 | 21.253 |
| 44698.15625 | 21.258 |
| 44698.166666666664 | 21.274 |
| 44698.177083333336 | 21.356 |
| 44698.1875 | 21.453 |
| 44698.197916666664 | 21.465 |
| 44698.208333333336 | 21.447 |
| 44698.21875 | 21.421 |
| 44698.229166666664 | 21.397 |
| 44698.239583333336 | 21.324 |
| 44698.25 | 21.417 |
| 44698.260416666664 | 21.508 |
| 44698.270833333336 | 21.718 |
| 44698.28125 | 21.852 |
| 44698.291666666664 | 21.799 |
| 44698.302083333336 | 21.828 |
| 44698.3125 | 21.833 |
| 44698.322916666664 | 21.793 |
| 44698.333333333336 | 21.779 |
| 44698.34375 | 21.779 |
| 44698.354166666664 | 21.676 |
| 44698.364583333336 | 21.773 |
| 44698.375 | 21.659 |
| 44698.385416666664 | 21.727 |
| 44698.395833333336 | 21.722 |
| 44698.40625 | 21.681 |
| 44698.416666666664 | 21.446 |
| 44698.427083333336 | 21.134 |
| 44698.4375 | 20.854 |
| 44698.447916666664 | 20.544 |
| 44698.458333333336 | 20.324 |
| 44698.46875 | 20.179 |
| 44698.479166666664 | 20.019 |
| 44698.489583333336 | 19.865 |
| 44698.5 | 19.747 |
| 44698.510416666664 | 19.56 |
| 44698.520833333336 | 19.489 |
| 44698.53125 | 19.487 |
| 44698.541666666664 | 19.451 |
| 44698.552083333336 | 19.406 |
| 44698.5625 | 19.371 |
| 44698.572916666664 | 19.396 |
| 44698.583333333336 | 19.434 |
| 44698.59375 | 19.498 |
| 44698.604166666664 | 19.644 |
| 44698.614583333336 | 19.775 |
| 44698.625 | 19.765 |
| 44698.635416666664 | 19.994 |
| 44698.645833333336 | 20.15 |
| 44698.65625 | 20.496 |
| 44698.666666666664 | 20.916 |
| 44698.677083333336 | 21.31 |
| 44698.6875 | 22.063 |
| 44698.697916666664 | 21.969 |
| 44698.708333333336 | 22.434 |
| 44698.71875 | 22.226 |
| 44698.729166666664 | 22.323 |
| 44698.739583333336 | 22.608 |
| 44698.75 | 23.013 |
| 44698.760416666664 | 23.328 |
| 44698.770833333336 | 23.612 |
| 44698.78125 | 23.767 |
| 44698.791666666664 | 23.973 |
| 44698.802083333336 | 23.992 |
| 44698.8125 | 24.076 |
| 44698.822916666664 | 24.251 |
| 44698.833333333336 | 24.291 |
| 44698.84375 | 24.37 |
| 44698.854166666664 | 24.408 |
| 44698.864583333336 | 24.429 |
| 44698.875 | 24.342 |
| 44698.885416666664 | 24.216 |
| 44698.895833333336 | 24.13 |
| 44698.90625 | 23.963 |
| 44698.916666666664 | 23.716 |
| 44698.927083333336 | 23.573 |
| 44698.9375 | 23.448 |
| 44698.947916666664 | 23.342 |
| 44698.958333333336 | 23.256 |
| 44698.96875 | 23.164 |
| 44698.979166666664 | 23.073 |
| 44698.989583333336 | 22.872 |
| 44699.0 | 22.511 |
| 44699.010416666664 | 22.167 |
| 44699.020833333336 | 21.887 |
| 44699.03125 | 21.731 |
| 44699.041666666664 | 21.635 |
| 44699.052083333336 | 21.595 |
| 44699.0625 | 21.604 |
| 44699.072916666664 | 21.602 |
| 44699.083333333336 | 21.554 |
| 44699.09375 | 21.401 |
| 44699.104166666664 | 21.23 |
| 44699.114583333336 | 21.08 |
| 44699.125 | 21.014 |
| 44699.135416666664 | 20.902 |
| 44699.145833333336 | 21.096 |
| 44699.15625 | 21.053 |
| 44699.166666666664 | 21.013 |
| 44699.177083333336 | 21.13 |
| 44699.1875 | 21.121 |
| 44699.197916666664 | 21.141 |
| 44699.208333333336 | 21.133 |
| 44699.21875 | 21.143 |
| 44699.229166666664 | 21.118 |
| 44699.239583333336 | 21.11 |
| 44699.25 | 21.07 |
| 44699.260416666664 | 21.004 |
| 44699.270833333336 | 20.926 |
| 44699.28125 | 21.018 |
| 44699.291666666664 | 21.242 |
| 44699.302083333336 | 21.464 |
| 44699.3125 | 21.555 |
| 44699.322916666664 | 21.602 |
| 44699.333333333336 | 21.527 |
| 44699.34375 | 21.564 |
| 44699.354166666664 | 21.522 |
| 44699.364583333336 | 21.514 |
| 44699.375 | 21.337 |
| 44699.385416666664 | 21.397 |
| 44699.395833333336 | 21.42 |
| 44699.40625 | 21.344 |
| 44699.416666666664 | 21.309 |
| 44699.427083333336 | 21.358 |
| 44699.4375 | 21.351 |
| 44699.447916666664 | 21.296 |
| 44699.458333333336 | 21.068 |
| 44699.46875 | 20.812 |
| 44699.479166666664 | 20.542 |
| 44699.489583333336 | 20.313 |
| 44699.5 | 20.182 |
| 44699.510416666664 | 20.082 |
| 44699.520833333336 | 19.929 |
| 44699.53125 | 19.765 |
| 44699.541666666664 | 19.604 |
| 44699.552083333336 | 19.47 |
| 44699.5625 | 19.44 |
| 44699.572916666664 | 19.501 |
| 44699.583333333336 | 19.497 |
| 44699.59375 | 19.471 |
| 44699.604166666664 | 19.428 |
| 44699.614583333336 | 19.444 |
| 44699.625 | 19.417 |
| 44699.635416666664 | 19.421 |
| 44699.645833333336 | 19.546 |
| 44699.65625 | 20.042 |
| 44699.666666666664 | 20.525 |
| 44699.677083333336 | 20.834 |
| 44699.6875 | 21.113 |
| 44699.697916666664 | 21.21 |
| 44699.708333333336 | 21.828 |
| 44699.71875 | 22.549 |
| 44699.729166666664 | 23.02 |
| 44699.739583333336 | 23.364 |
| 44699.75 | 23.445 |
| 44699.760416666664 | 23.176 |
| 44699.770833333336 | 22.895 |
| 44699.78125 | 23.138 |
| 44699.791666666664 | 23.323 |
| 44699.802083333336 | 23.335 |
| 44699.8125 | 23.577 |
| 44699.822916666664 | 23.772 |
| 44699.833333333336 | 23.82 |
| 44699.84375 | 23.92 |
| 44699.854166666664 | 23.885 |
| 44699.864583333336 | 23.973 |
| 44699.875 | 24.019 |
| 44699.885416666664 | 24.077 |
| 44699.895833333336 | 24.048 |
| 44699.90625 | 23.962 |
| 44699.916666666664 | 23.848 |
| 44699.927083333336 | 23.682 |
| 44699.9375 | 23.511 |
| 44699.947916666664 | 23.23 |
| 44699.958333333336 | 22.932 |
| 44699.96875 | 22.656 |
| 44699.979166666664 | 22.472 |
| 44699.989583333336 | 22.34 |
| 44700.0 | 22.189 |
| 44700.010416666664 | 21.999 |
| 44700.020833333336 | 21.826 |
| 44700.03125 | 21.656 |
| 44700.041666666664 | 21.444 |
| 44700.052083333336 | 21.232 |
| 44700.0625 | 21.076 |
| 44700.072916666664 | 20.933 |
| 44700.083333333336 | 20.881 |
| 44700.09375 | 20.887 |
| 44700.104166666664 | 20.924 |
| 44700.114583333336 | 20.919 |
| 44700.125 | 20.894 |
| 44700.135416666664 | 20.816 |
| 44700.145833333336 | 20.784 |
| 44700.15625 | 20.69 |
| 44700.166666666664 | 20.591 |
| 44700.177083333336 | 20.643 |
| 44700.1875 | 20.766 |
| 44700.197916666664 | 20.637 |
| 44700.208333333336 | 20.584 |
| 44700.21875 | 20.31 |
| 44700.229166666664 | 20.234 |
| 44700.239583333336 | 20.108 |
| 44700.25 | 20.023 |
| 44700.260416666664 | 19.89 |
| 44700.270833333336 | 19.835 |
| 44700.28125 | 19.758 |
| 44700.291666666664 | 19.67 |
| 44700.302083333336 | 19.672 |
| 44700.3125 | 19.816 |
| 44700.322916666664 | 19.869 |
| 44700.333333333336 | 19.882 |
| 44700.34375 | 20.057 |
| 44700.354166666664 | 20.094 |
| 44700.364583333336 | 20.269 |
| 44700.375 | 20.39 |
| 44700.385416666664 | 20.474 |
| 44700.395833333336 | 20.524 |
| 44700.40625 | 20.528 |
| 44700.416666666664 | 20.557 |
| 44700.427083333336 | 20.538 |
| 44700.4375 | 20.492 |
| 44700.447916666664 | 20.461 |
| 44700.458333333336 | 20.505 |
| 44700.46875 | 20.476 |
| 44700.479166666664 | 20.416 |
| 44700.489583333336 | 20.32 |
| 44700.5 | 20.18 |
| 44700.510416666664 | 20.066 |
| 44700.520833333336 | 19.999 |
| 44700.53125 | 19.967 |
| 44700.541666666664 | 19.965 |
| 44700.552083333336 | 19.961 |
| 44700.5625 | 19.962 |
| 44700.572916666664 | 19.968 |
| 44700.583333333336 | 20.009 |
| 44700.59375 | 20.065 |
| 44700.604166666664 | 20.129 |
| 44700.614583333336 | 20.176 |
| 44700.625 | 20.214 |
| 44700.635416666664 | 20.233 |
| 44700.645833333336 | 20.263 |
| 44700.65625 | 20.314 |
| 44700.666666666664 | 20.379 |
| 44700.677083333336 | 20.46 |
| 44700.6875 | 20.56 |
| 44700.697916666664 | 20.622 |
| 44700.708333333336 | 20.994 |
| 44700.71875 | 21.578 |
| 44700.729166666664 | 22.056 |
| 44700.739583333336 | 22.524 |
| 44700.75 | 22.869 |
| 44700.760416666664 | 23.452 |
| 44700.770833333336 | 23.611 |
| 44700.78125 | 24.195 |
| 44700.791666666664 | 23.721 |
| 44700.802083333336 | 23.866 |
| 44700.8125 | 24.115 |
| 44700.822916666664 | 24.452 |
| 44700.833333333336 | 24.829 |
| 44700.84375 | 25.105 |
| 44700.854166666664 | 25.305 |
| 44700.864583333336 | 25.561 |
| 44700.875 | 25.517 |
| 44700.885416666664 | 25.528 |
| 44700.895833333336 | 25.463 |
| 44700.90625 | 25.52 |
| 44700.916666666664 | 25.566 |
| 44700.927083333336 | 25.583 |
| 44700.9375 | 25.534 |
| 44700.947916666664 | 25.468 |
| 44700.958333333336 | 25.337 |
| 44700.96875 | 25.221 |
| 44700.979166666664 | 25.037 |
| 44700.989583333336 | 24.69 |
| 44701.0 | 24.313 |
| 44701.010416666664 | 24.09 |
| 44701.020833333336 | 23.937 |
| 44701.03125 | 23.734 |
| 44701.041666666664 | 23.533 |
| 44701.052083333336 | 23.327 |
| 44701.0625 | 23.206 |
| 44701.072916666664 | 23.021 |
| 44701.083333333336 | 22.731 |
| 44701.09375 | 22.459 |
| 44701.104166666664 | 22.238 |
| 44701.114583333336 | 22.083 |
| 44701.125 | 22.025 |
| 44701.135416666664 | 21.999 |
| 44701.145833333336 | 22.01 |
| 44701.15625 | 22.01 |
| 44701.166666666664 | 21.971 |
| 44701.177083333336 | 21.928 |
| 44701.1875 | 21.888 |
| 44701.197916666664 | 21.818 |
| 44701.208333333336 | 21.759 |
| 44701.21875 | 21.835 |
| 44701.229166666664 | 21.859 |
| 44701.239583333336 | 21.792 |
| 44701.25 | 21.84 |
| 44701.260416666664 | 21.88 |
| 44701.270833333336 | 21.836 |
| 44701.28125 | 21.791 |
| 44701.291666666664 | 21.815 |
| 44701.302083333336 | 21.877 |
| 44701.3125 | 21.864 |
| 44701.322916666664 | 21.893 |
| 44701.333333333336 | 21.896 |
| 44701.34375 | 21.896 |
| 44701.354166666664 | 21.863 |
| 44701.364583333336 | 21.922 |
| 44701.375 | 22.053 |
| 44701.385416666664 | 22.275 |
| 44701.395833333336 | 22.417 |
| 44701.40625 | 22.61 |
| 44701.416666666664 | 22.681 |
| 44701.427083333336 | 22.763 |
| 44701.4375 | 22.826 |
| 44701.447916666664 | 22.881 |
| 44701.458333333336 | 22.93 |
| 44701.46875 | 22.964 |
| 44701.479166666664 | 22.952 |
| 44701.489583333336 | 22.852 |
| 44701.5 | 22.868 |
| 44701.510416666664 | 22.847 |
| 44701.520833333336 | 22.768 |
| 44701.53125 | 22.639 |
| 44701.541666666664 | 22.359 |
| 44701.552083333336 | 22.19 |
| 44701.5625 | 22.16 |
| 44701.572916666664 | 22.163 |
| 44701.583333333336 | 22.194 |
| 44701.59375 | 22.244 |
| 44701.604166666664 | 22.256 |
| 44701.614583333336 | 22.25 |
| 44701.625 | 22.246 |
| 44701.635416666664 | 22.236 |
| 44701.645833333336 | 22.245 |
| 44701.65625 | 22.27 |
| 44701.666666666664 | 22.232 |
| 44701.677083333336 | 22.229 |
| 44701.6875 | 22.253 |
| 44701.697916666664 | 22.257 |
| 44701.708333333336 | 22.384 |
| 44701.71875 | 22.344 |
| 44701.729166666664 | 22.962 |
| 44701.739583333336 | 22.714 |
| 44701.75 | 23.259 |
| 44701.760416666664 | 24.048 |
| 44701.770833333336 | 25.181 |
| 44701.78125 | 25.73 |
| 44701.791666666664 | 26.245 |
| 44701.802083333336 | 26.115 |
| 44701.8125 | 26.183 |
| 44701.822916666664 | 26.943 |
| 44701.833333333336 | 27.21 |
| 44701.84375 | 27.87 |
| 44701.854166666664 | 27.323 |
| 44701.864583333336 | 27.372 |
| 44701.875 | 27.102 |
| 44701.885416666664 | 26.746 |
| 44701.895833333336 | 27.044 |
| 44701.90625 | 27.126 |
| 44701.916666666664 | 27.105 |
| 44701.927083333336 | 27.087 |
| 44701.9375 | 27.14 |
| 44701.947916666664 | 27.168 |
| 44701.958333333336 | 27.176 |
| 44701.96875 | 27.148 |
| 44701.979166666664 | 27.029 |
| 44701.989583333336 | 26.906 |
| 44702.0 | 26.728 |
| 44702.010416666664 | 26.554 |
| 44702.020833333336 | 26.321 |
| 44702.03125 | 25.979 |
| 44702.041666666664 | 25.634 |
| 44702.052083333336 | 25.373 |
| 44702.0625 | 25.208 |
| 44702.072916666664 | 25.089 |
| 44702.083333333336 | 24.976 |
| 44702.09375 | 24.918 |
| 44702.104166666664 | 24.877 |
| 44702.114583333336 | 24.751 |
| 44702.125 | 24.536 |
| 44702.135416666664 | 24.311 |
| 44702.145833333336 | 24.128 |
| 44702.15625 | 23.903 |
| 44702.166666666664 | 23.747 |
| 44702.177083333336 | 23.632 |
| 44702.1875 | 23.537 |
| 44702.197916666664 | 23.465 |
| 44702.208333333336 | 23.467 |
| 44702.21875 | 23.483 |
| 44702.229166666664 | 23.493 |
| 44702.239583333336 | 23.494 |
| 44702.25 | 23.54 |
| 44702.260416666664 | 23.586 |
| 44702.270833333336 | 23.544 |
| 44702.28125 | 23.55 |
| 44702.291666666664 | 23.531 |
| 44702.302083333336 | 23.507 |
| 44702.3125 | 23.494 |
| 44702.322916666664 | 23.538 |
| 44702.333333333336 | 23.525 |
| 44702.34375 | 23.519 |
| 44702.354166666664 | 23.504 |
| 44702.364583333336 | 23.543 |
| 44702.375 | 23.53 |
| 44702.385416666664 | 23.514 |
| 44702.395833333336 | 23.648 |
| 44702.40625 | 23.696 |
| 44702.416666666664 | 23.94 |
| 44702.427083333336 | 24.118 |
| 44702.4375 | 24.226 |
| 44702.447916666664 | 24.239 |
| 44702.458333333336 | 24.349 |
| 44702.46875 | 24.389 |
| 44702.479166666664 | 24.486 |
| 44702.489583333336 | 24.531 |
| 44702.5 | 24.565 |
| 44702.510416666664 | 24.563 |
| 44702.520833333336 | 24.553 |
| 44702.53125 | 24.51 |
| 44702.541666666664 | 24.51 |
| 44702.552083333336 | 24.468 |
| 44702.5625 | 24.415 |
| 44702.572916666664 | 24.278 |
| 44702.583333333336 | 24.162 |
| 44702.59375 | 24.265 |
| 44702.604166666664 | 24.288 |
| 44702.614583333336 | 24.31 |
| 44702.625 | 24.354 |
| 44702.635416666664 | 24.429 |
| 44702.645833333336 | 24.459 |
| 44702.65625 | 24.534 |
| 44702.666666666664 | 24.61 |
| 44702.677083333336 | 24.669 |
| 44702.6875 | 24.664 |
| 44702.697916666664 | 24.618 |
| 44702.708333333336 | 24.603 |
| 44702.71875 | 24.534 |
| 44702.729166666664 | 24.584 |
| 44702.739583333336 | 24.634 |
| 44702.75 | 24.738 |
| 44702.760416666664 | 24.826 |
| 44702.770833333336 | 24.914 |
| 44702.78125 | 24.936 |
| 44702.791666666664 | 25.13 |
| 44702.802083333336 | 25.927 |
| 44702.8125 | 26.135 |
| 44702.822916666664 | 27.093 |
| 44702.833333333336 | 27.843 |
| 44702.84375 | 27.857 |
| 44702.854166666664 | 28.272 |
| 44702.864583333336 | 28.397 |
| 44702.875 | 28.538 |
| 44702.885416666664 | 28.485 |
| 44702.895833333336 | 28.383 |
| 44702.90625 | 27.722 |
| 44702.916666666664 | 27.86 |
| 44702.927083333336 | 28.007 |
| 44702.9375 | 28.102 |
| 44702.947916666664 | 28.132 |
| 44702.958333333336 | 28.131 |
| 44702.96875 | 28.084 |
| 44702.979166666664 | 28.076 |
| 44702.989583333336 | 28.071 |
| 44703.0 | 28.039 |
| 44703.010416666664 | 28.006 |
| 44703.020833333336 | 27.929 |
| 44703.03125 | 27.854 |
| 44703.041666666664 | 27.849 |
| 44703.052083333336 | 27.711 |
| 44703.0625 | 27.45 |
| 44703.072916666664 | 27.071 |
| 44703.083333333336 | 26.696 |
| 44703.09375 | 26.454 |
| 44703.104166666664 | 26.309 |
| 44703.114583333336 | 26.172 |
| 44703.125 | 26.007 |
| 44703.135416666664 | 25.939 |
| 44703.145833333336 | 25.852 |
| 44703.15625 | 25.737 |
| 44703.166666666664 | 25.519 |
| 44703.177083333336 | 25.364 |
| 44703.1875 | 25.186 |
| 44703.197916666664 | 25.104 |
| 44703.208333333336 | 25.002 |
| 44703.21875 | 24.851 |
| 44703.229166666664 | 24.847 |
| 44703.239583333336 | 24.856 |
| 44703.25 | 24.883 |
| 44703.260416666664 | 24.898 |
| 44703.270833333336 | 24.885 |
| 44703.28125 | 24.864 |
| 44703.291666666664 | 24.857 |
| 44703.302083333336 | 24.903 |
| 44703.3125 | 24.857 |
| 44703.322916666664 | 24.75 |
| 44703.333333333336 | 24.661 |
| 44703.34375 | 24.534 |
| 44703.354166666664 | 24.434 |
| 44703.364583333336 | 24.368 |
| 44703.375 | 24.256 |
| 44703.385416666664 | 24.183 |
| 44703.395833333336 | 23.998 |
| 44703.40625 | 23.98 |
| 44703.416666666664 | 23.945 |
| 44703.427083333336 | 24.089 |
| 44703.4375 | 24.194 |
| 44703.447916666664 | 24.404 |
| 44703.458333333336 | 24.526 |
| 44703.46875 | 24.682 |
| 44703.479166666664 | 24.772 |
| 44703.489583333336 | 24.849 |
| 44703.5 | 24.913 |
| 44703.510416666664 | 24.954 |
| 44703.520833333336 | 25.047 |
| 44703.53125 | 25.089 |
| 44703.541666666664 | 25.149 |
| 44703.552083333336 | 25.181 |
| 44703.5625 | 25.178 |
| 44703.572916666664 | 25.177 |
| 44703.583333333336 | 25.145 |
| 44703.59375 | 25.127 |
| 44703.604166666664 | 25.134 |
| 44703.614583333336 | 25.114 |
| 44703.625 | 25.124 |
| 44703.635416666664 | 25.208 |
| 44703.645833333336 | 25.281 |
| 44703.65625 | 25.349 |
| 44703.666666666664 | 25.439 |
| 44703.677083333336 | 25.552 |
| 44703.6875 | 25.682 |
| 44703.697916666664 | 25.786 |
| 44703.708333333336 | 25.89 |
| 44703.71875 | 25.932 |
| 44703.729166666664 | 25.983 |
| 44703.739583333336 | 26.004 |
| 44703.75 | 25.973 |
| 44703.760416666664 | 25.944 |
| 44703.770833333336 | 25.947 |
| 44703.78125 | 26.043 |
| 44703.791666666664 | 26.11 |
| 44703.802083333336 | 26.227 |
| 44703.8125 | 26.289 |
| 44703.822916666664 | 26.343 |
| 44703.833333333336 | 26.623 |
| 44703.84375 | 26.725 |
| 44703.854166666664 | 26.816 |
| 44703.864583333336 | 28.066 |
| 44703.875 | 28.149 |
| 44703.885416666664 | 28.543 |
| 44703.895833333336 | 28.878 |
| 44703.90625 | 28.761 |
| 44703.916666666664 | 28.655 |
| 44703.927083333336 | 28.475 |
| 44703.9375 | 28.325 |
| 44703.947916666664 | 28.529 |
| 44703.958333333336 | 28.696 |
| 44703.96875 | 28.797 |
| 44703.979166666664 | 28.857 |
| 44703.989583333336 | 28.912 |
| 44704.0 | 28.865 |
| 44704.010416666664 | 28.845 |
| 44704.020833333336 | 28.797 |
| 44704.03125 | 28.756 |
| 44704.041666666664 | 28.751 |
| 44704.052083333336 | 28.751 |
| 44704.0625 | 28.755 |
| 44704.072916666664 | 28.616 |
| 44704.083333333336 | 28.624 |
| 44704.09375 | 28.63 |
| 44704.104166666664 | 28.598 |
| 44704.114583333336 | 28.525 |
| 44704.125 | 28.268 |
| 44704.135416666664 | 27.993 |
| 44704.145833333336 | 27.707 |
| 44704.15625 | 27.435 |
| 44704.166666666664 | 27.152 |
| 44704.177083333336 | 26.918 |
| 44704.1875 | 26.723 |
| 44704.197916666664 | 26.531 |
| 44704.208333333336 | 26.393 |
| 44704.21875 | 26.265 |
| 44704.229166666664 | 26.148 |
| 44704.239583333336 | 26.011 |
| 44704.25 | 25.91 |
| 44704.260416666664 | 25.796 |
| 44704.270833333336 | 25.656 |
| 44704.28125 | 25.491 |
| 44704.291666666664 | 25.369 |
| 44704.302083333336 | 25.258 |
| 44704.3125 | 25.174 |
| 44704.322916666664 | 25.132 |
| 44704.333333333336 | 25.285 |
| 44704.34375 | 25.264 |
| 44704.354166666664 | 25.129 |
| 44704.364583333336 | 25.135 |
| 44704.375 | 25.099 |
| 44704.385416666664 | 25.054 |
| 44704.395833333336 | 24.992 |
| 44704.40625 | 24.954 |
| 44704.416666666664 | 24.865 |
| 44704.427083333336 | 24.776 |
| 44704.4375 | 24.681 |
| 44704.447916666664 | 24.613 |
| 44704.458333333336 | 24.876 |
| 44704.46875 | 24.925 |
| 44704.479166666664 | 25.085 |
| 44704.489583333336 | 25.145 |
| 44704.5 | 25.301 |
| 44704.510416666664 | 25.432 |
| 44704.520833333336 | 25.503 |
| 44704.53125 | 25.558 |
| 44704.541666666664 | 25.586 |
| 44704.552083333336 | 25.582 |
| 44704.5625 | 25.593 |
| 44704.572916666664 | 25.592 |
| 44704.583333333336 | 25.571 |
| 44704.59375 | 25.495 |
| 44704.604166666664 | 25.494 |
| 44704.614583333336 | 25.481 |
| 44704.625 | 25.486 |
| 44704.635416666664 | 25.489 |
| 44704.645833333336 | 25.441 |
| 44704.65625 | 25.294 |
| 44704.666666666664 | 25.091 |
| 44704.677083333336 | 24.905 |
| 44704.6875 | 24.896 |
| 44704.697916666664 | 24.84 |
| 44704.708333333336 | 24.744 |
| 44704.71875 | 24.632 |
| 44704.729166666664 | 24.562 |
| 44704.739583333336 | 24.511 |
| 44704.75 | 24.459 |
| 44704.760416666664 | 24.388 |
| 44704.770833333336 | 24.336 |
| 44704.78125 | 24.293 |
| 44704.791666666664 | 24.264 |
| 44704.802083333336 | 24.213 |
| 44704.8125 | 24.163 |
| 44704.822916666664 | 24.079 |
| 44704.833333333336 | 24.14 |
| 44704.84375 | 23.927 |
| 44704.854166666664 | 24.074 |
| 44704.864583333336 | 24.144 |
| 44704.875 | 24.249 |
| 44704.885416666664 | 24.17 |
| 44704.895833333336 | 24.17 |
| 44704.90625 | 24.194 |
| 44704.916666666664 | 24.219 |
| 44704.927083333336 | 24.256 |
| 44704.9375 | 24.256 |
| 44704.947916666664 | 24.207 |
| 44704.958333333336 | 24.119 |
| 44704.96875 | 23.968 |
| 44704.979166666664 | 23.923 |
| 44704.989583333336 | 24.003 |
| 44705.0 | 23.985 |
| 44705.010416666664 | 23.975 |
| 44705.020833333336 | 24.004 |
| 44705.03125 | 23.987 |
| 44705.041666666664 | 23.953 |
| 44705.052083333336 | 23.899 |
| 44705.0625 | 23.875 |
| 44705.072916666664 | 23.879 |
| 44705.083333333336 | 23.927 |
| 44705.09375 | 23.903 |
| 44705.104166666664 | 23.878 |
| 44705.114583333336 | 23.828 |
| 44705.125 | 23.754 |
| 44705.135416666664 | 23.7 |
| 44705.145833333336 | 23.699 |
| 44705.15625 | 23.679 |
| 44705.166666666664 | 23.631 |
| 44705.177083333336 | 23.572 |
| 44705.1875 | 23.427 |
| 44705.197916666664 | 23.266 |
| 44705.208333333336 | 23.086 |
| 44705.21875 | 22.915 |
| 44705.229166666664 | 22.795 |
| 44705.239583333336 | 22.706 |
| 44705.25 | 22.622 |
| 44705.260416666664 | 22.58 |
| 44705.270833333336 | 22.53 |
| 44705.28125 | 22.481 |
| 44705.291666666664 | 22.403 |
| 44705.302083333336 | 22.351 |
| 44705.3125 | 22.288 |
| 44705.322916666664 | 22.236 |
| 44705.333333333336 | 22.2 |
| 44705.34375 | 22.148 |
| 44705.354166666664 | 22.139 |
| 44705.364583333336 | 22.131 |
| 44705.375 | 22.179 |
| 44705.385416666664 | 21.993 |
| 44705.395833333336 | 21.897 |
| 44705.40625 | 21.667 |
| 44705.416666666664 | 21.462 |
| 44705.427083333336 | 21.209 |
| 44705.4375 | 21.069 |
| 44705.447916666664 | 21.205 |
| 44705.458333333336 | 21.172 |
| 44705.46875 | 20.873 |
| 44705.479166666664 | 21.104 |
| 44705.489583333336 | 21.065 |
| 44705.5 | 20.992 |
| 44705.510416666664 | 20.876 |
| 44705.520833333336 | 20.871 |
| 44705.53125 | 20.986 |
| 44705.541666666664 | 20.935 |
| 44705.552083333336 | 20.856 |
| 44705.5625 | 20.912 |
| 44705.572916666664 | 20.962 |
| 44705.583333333336 | 20.968 |
| 44705.59375 | 21.036 |
| 44705.604166666664 | 21.069 |
| 44705.614583333336 | 21.146 |
| 44705.625 | 21.182 |
| 44705.635416666664 | 21.168 |
| 44705.645833333336 | 21.069 |
| 44705.65625 | 21.086 |
| 44705.666666666664 | 21.072 |
| 44705.677083333336 | 21.041 |
| 44705.6875 | 20.979 |
| 44705.697916666664 | 20.929 |
| 44705.708333333336 | 20.888 |
| 44705.71875 | 20.815 |
| 44705.729166666664 | 20.734 |
| 44705.739583333336 | 20.636 |
| 44705.75 | 20.522 |
| 44705.760416666664 | 20.367 |
| 44705.770833333336 | 20.231 |
| 44705.78125 | 20.149 |
| 44705.791666666664 | 20.092 |
| 44705.802083333336 | 20.06 |
| 44705.8125 | 20.041 |
| 44705.822916666664 | 20.003 |
| 44705.833333333336 | 19.959 |
| 44705.84375 | 19.913 |
| 44705.854166666664 | 19.882 |
| 44705.864583333336 | 19.859 |
| 44705.875 | 19.842 |
| 44705.885416666664 | 19.627 |
| 44705.895833333336 | 19.606 |
| 44705.90625 | 19.42 |
| 44705.916666666664 | 19.273 |
| 44705.927083333336 | 19.21 |
| 44705.9375 | 19.138 |
| 44705.947916666664 | 19.239 |
| 44705.958333333336 | 19.21 |
| 44705.96875 | 18.974 |
| 44705.979166666664 | 18.708 |
| 44705.989583333336 | 18.544 |
| 44706.0 | 18.494 |
| 44706.010416666664 | 18.414 |
| 44706.020833333336 | 18.288 |
| 44706.03125 | 18.175 |
| 44706.041666666664 | 18.099 |
| 44706.052083333336 | 17.915 |
| 44706.0625 | 17.919 |
| 44706.072916666664 | 17.699 |
| 44706.083333333336 | 17.766 |
| 44706.09375 | 17.872 |
| 44706.104166666664 | 18.09 |
| 44706.114583333336 | 17.944 |
| 44706.125 | 18.041 |
| 44706.135416666664 | 18.084 |
| 44706.145833333336 | 18.222 |
| 44706.15625 | 18.375 |
| 44706.166666666664 | 18.359 |
| 44706.177083333336 | 18.324 |
| 44706.1875 | 18.229 |
| 44706.197916666664 | 18.281 |
| 44706.208333333336 | 18.289 |
| 44706.21875 | 18.295 |
| 44706.229166666664 | 18.256 |
| 44706.239583333336 | 18.221 |
| 44706.25 | 18.165 |
| 44706.260416666664 | 18.09 |
| 44706.270833333336 | 18.012 |
| 44706.28125 | 17.94 |
| 44706.291666666664 | 17.828 |
| 44706.302083333336 | 17.742 |
| 44706.3125 | 17.644 |
| 44706.322916666664 | 17.552 |
| 44706.333333333336 | 17.501 |
| 44706.34375 | 17.455 |
| 44706.354166666664 | 17.411 |
| 44706.364583333336 | 17.352 |
| 44706.375 | 17.306 |
| 44706.385416666664 | 17.274 |
| 44706.395833333336 | 17.325 |
| 44706.40625 | 17.287 |
| 44706.416666666664 | 17.311 |
| 44706.427083333336 | 17.358 |
| 44706.4375 | 17.281 |
| 44706.447916666664 | 17.242 |
| 44706.458333333336 | 17.233 |
| 44706.46875 | 17.211 |
| 44706.479166666664 | 17.212 |
| 44706.489583333336 | 17.213 |
| 44706.5 | 17.222 |
| 44706.510416666664 | 17.197 |
| 44706.520833333336 | 17.214 |
| 44706.53125 | 17.195 |
| 44706.541666666664 | 17.215 |
| 44706.552083333336 | 17.218 |
| 44706.5625 | 17.2 |
| 44706.572916666664 | 17.214 |
| 44706.583333333336 | 17.278 |
| 44706.59375 | 17.326 |
| 44706.604166666664 | 17.383 |
| 44706.614583333336 | 17.427 |
| 44706.625 | 17.467 |
| 44706.635416666664 | 17.527 |
| 44706.645833333336 | 17.588 |
| 44706.65625 | 17.644 |
| 44706.666666666664 | 17.737 |
| 44706.677083333336 | 17.831 |
| 44706.6875 | 17.835 |
| 44706.697916666664 | 17.807 |
| 44706.708333333336 | 17.811 |
| 44706.71875 | 17.816 |
| 44706.729166666664 | 17.828 |
| 44706.739583333336 | 17.848 |
| 44706.75 | 17.849 |
| 44706.760416666664 | 17.85 |
| 44706.770833333336 | 17.861 |
| 44706.78125 | 17.903 |
| 44706.791666666664 | 17.944 |
| 44706.802083333336 | 17.981 |
| 44706.8125 | 18.024 |
| 44706.822916666664 | 18.06 |
| 44706.833333333336 | 18.083 |
| 44706.84375 | 18.083 |
| 44706.854166666664 | 18.071 |
| 44706.864583333336 | 18.06 |
| 44706.875 | 18.076 |
| 44706.885416666664 | 18.083 |
| 44706.895833333336 | 18.108 |
| 44706.90625 | 18.252 |
| 44706.916666666664 | 18.16 |
| 44706.927083333336 | 18.19 |
| 44706.9375 | 18.403 |
| 44706.947916666664 | 18.331 |
| 44706.958333333336 | 18.26 |
| 44706.96875 | 18.246 |
| 44706.979166666664 | 18.229 |
| 44706.989583333336 | 18.241 |
| 44707.0 | 18.224 |
| 44707.010416666664 | 18.255 |
| 44707.020833333336 | 18.296 |
| 44707.03125 | 18.33 |
| 44707.041666666664 | 18.268 |
| 44707.052083333336 | 18.279 |
| 44707.0625 | 18.265 |
| 44707.072916666664 | 18.213 |
| 44707.083333333336 | 18.13 |
| 44707.09375 | 18.036 |
| 44707.104166666664 | 18.056 |
| 44707.114583333336 | 18.125 |
| 44707.125 | 18.126 |
| 44707.135416666664 | 18.166 |
| 44707.145833333336 | 18.147 |
| 44707.15625 | 18.12 |
| 44707.166666666664 | 18.183 |
| 44707.177083333336 | 18.269 |
| 44707.1875 | 18.288 |
| 44707.197916666664 | 18.278 |
| 44707.208333333336 | 18.243 |
| 44707.21875 | 18.183 |
| 44707.229166666664 | 18.192 |
| 44707.239583333336 | 18.211 |
| 44707.25 | 18.181 |
| 44707.260416666664 | 18.121 |
| 44707.270833333336 | 18.089 |
| 44707.28125 | 18.031 |
| 44707.291666666664 | 17.939 |
| 44707.302083333336 | 17.859 |
| 44707.3125 | 17.803 |
| 44707.322916666664 | 17.73 |
| 44707.333333333336 | 17.653 |
| 44707.34375 | 17.557 |
| 44707.354166666664 | 17.523 |
| 44707.364583333336 | 17.48 |
| 44707.375 | 17.448 |
| 44707.385416666664 | 17.422 |
| 44707.395833333336 | 17.395 |
| 44707.40625 | 17.366 |
| 44707.416666666664 | 17.338 |
| 44707.427083333336 | 17.324 |
| 44707.4375 | 17.301 |
| 44707.447916666664 | 17.213 |
| 44707.458333333336 | 17.332 |
| 44707.46875 | 17.286 |
| 44707.479166666664 | 17.272 |
| 44707.489583333336 | 17.281 |
| 44707.5 | 17.257 |
| 44707.510416666664 | 17.266 |
| 44707.520833333336 | 17.278 |
| 44707.53125 | 17.291 |
| 44707.541666666664 | 17.304 |
| 44707.552083333336 | 17.325 |
| 44707.5625 | 17.366 |
| 44707.572916666664 | 17.391 |
| 44707.583333333336 | 17.44 |
| 44707.59375 | 17.451 |
| 44707.604166666664 | 17.51 |
| 44707.614583333336 | 17.55 |
| 44707.625 | 17.623 |
| 44707.635416666664 | 17.805 |
| 44707.645833333336 | 17.892 |
| 44707.65625 | 17.984 |
| 44707.666666666664 | 18.051 |
| 44707.677083333336 | 18.079 |
| 44707.6875 | 18.143 |
| 44707.697916666664 | 18.239 |
| 44707.708333333336 | 18.301 |
| 44707.71875 | 18.288 |
| 44707.729166666664 | 18.218 |
| 44707.739583333336 | 18.142 |
| 44707.75 | 18.149 |
| 44707.760416666664 | 18.176 |
| 44707.770833333336 | 18.167 |
| 44707.78125 | 18.17 |
| 44707.791666666664 | 18.187 |
| 44707.802083333336 | 18.228 |
| 44707.8125 | 18.275 |
| 44707.822916666664 | 18.293 |
| 44707.833333333336 | 18.309 |
| 44707.84375 | 18.362 |
| 44707.854166666664 | 18.381 |
| 44707.864583333336 | 18.41 |
| 44707.875 | 18.419 |
| 44707.885416666664 | 18.411 |
| 44707.895833333336 | 18.402 |
| 44707.90625 | 18.355 |
| 44707.916666666664 | 18.319 |
| 44707.927083333336 | 18.276 |
| 44707.9375 | 18.234 |
| 44707.947916666664 | 18.205 |
| 44707.958333333336 | 18.198 |
| 44707.96875 | 18.204 |
| 44707.979166666664 | 18.191 |
| 44707.989583333336 | 18.254 |
| 44708.0 | 18.448 |
| 44708.010416666664 | 18.404 |
| 44708.020833333336 | 18.415 |
| 44708.03125 | 18.425 |
| 44708.041666666664 | 18.392 |
| 44708.052083333336 | 18.432 |
| 44708.0625 | 18.527 |
| 44708.072916666664 | 18.584 |
| 44708.083333333336 | 18.626 |
| 44708.09375 | 18.721 |
| 44708.104166666664 | 18.777 |
| 44708.114583333336 | 18.853 |
| 44708.125 | 18.929 |
| 44708.135416666664 | 18.926 |
| 44708.145833333336 | 18.934 |
| 44708.15625 | 18.925 |
| 44708.166666666664 | 18.929 |
| 44708.177083333336 | 18.946 |
| 44708.1875 | 18.972 |
| 44708.197916666664 | 18.989 |
| 44708.208333333336 | 19.01 |
| 44708.21875 | 19.02 |
| 44708.229166666664 | 19.012 |
| 44708.239583333336 | 18.99 |
| 44708.25 | 18.962 |
| 44708.260416666664 | 18.95 |
| 44708.270833333336 | 18.936 |
| 44708.28125 | 18.909 |
| 44708.291666666664 | 18.873 |
| 44708.302083333336 | 18.809 |
| 44708.3125 | 18.701 |
| 44708.322916666664 | 18.61 |
| 44708.333333333336 | 18.552 |
| 44708.34375 | 18.521 |
| 44708.354166666664 | 18.483 |
| 44708.364583333336 | 18.45 |
| 44708.375 | 18.424 |
| 44708.385416666664 | 18.381 |
| 44708.395833333336 | 18.35 |
| 44708.40625 | 18.307 |
| 44708.416666666664 | 18.276 |
| 44708.427083333336 | 18.247 |
| 44708.4375 | 18.199 |
| 44708.447916666664 | 18.147 |
| 44708.458333333336 | 18.105 |
| 44708.46875 | 18.08 |
| 44708.479166666664 | 18.072 |
| 44708.489583333336 | 18.064 |
| 44708.5 | 18.181 |
| 44708.510416666664 | 18.163 |
| 44708.520833333336 | 18.236 |
| 44708.53125 | 18.331 |
| 44708.541666666664 | 18.399 |
| 44708.552083333336 | 18.477 |
| 44708.5625 | 18.433 |
| 44708.572916666664 | 18.465 |
| 44708.583333333336 | 18.723 |
| 44708.59375 | 18.859 |
| 44708.604166666664 | 19.009 |
| 44708.614583333336 | 19.136 |
| 44708.625 | 19.247 |
| 44708.635416666664 | 19.523 |
| 44708.645833333336 | 19.728 |
| 44708.65625 | 19.937 |
| 44708.666666666664 | 20.115 |
| 44708.677083333336 | 20.2 |
| 44708.6875 | 20.316 |
| 44708.697916666664 | 20.379 |
| 44708.708333333336 | 20.398 |
| 44708.71875 | 20.304 |
| 44708.729166666664 | 20.359 |
| 44708.739583333336 | 20.288 |
| 44708.75 | 20.144 |
| 44708.760416666664 | 20.005 |
| 44708.770833333336 | 19.954 |
| 44708.78125 | 20.061 |
| 44708.791666666664 | 20.081 |
| 44708.802083333336 | 20.063 |
| 44708.8125 | 20.017 |
| 44708.822916666664 | 20.014 |
| 44708.833333333336 | 20.03 |
| 44708.84375 | 20.109 |
| 44708.854166666664 | 20.204 |
| 44708.864583333336 | 20.256 |
| 44708.875 | 20.295 |
| 44708.885416666664 | 20.301 |
| 44708.895833333336 | 20.328 |
| 44708.90625 | 20.355 |
| 44708.916666666664 | 20.344 |
| 44708.927083333336 | 20.319 |
| 44708.9375 | 20.281 |
| 44708.947916666664 | 20.222 |
| 44708.958333333336 | 20.164 |
| 44708.96875 | 20.108 |
| 44708.979166666664 | 20.031 |
| 44708.989583333336 | 20.019 |
| 44709.0 | 19.997 |
| 44709.010416666664 | 19.958 |
| 44709.020833333336 | 20.03 |
| 44709.03125 | 20.106 |
| 44709.041666666664 | 20.004 |
| 44709.052083333336 | 20.053 |
| 44709.0625 | 20.113 |
| 44709.072916666664 | 20.248 |
| 44709.083333333336 | 20.338 |
| 44709.09375 | 20.357 |
| 44709.104166666664 | 20.374 |
| 44709.114583333336 | 20.408 |
| 44709.125 | 20.352 |
| 44709.135416666664 | 20.372 |
| 44709.145833333336 | 20.408 |
| 44709.15625 | 20.437 |
| 44709.166666666664 | 20.529 |
| 44709.177083333336 | 20.529 |
| 44709.1875 | 20.565 |
| 44709.197916666664 | 20.616 |
| 44709.208333333336 | 20.636 |
| 44709.21875 | 20.656 |
| 44709.229166666664 | 20.704 |
| 44709.239583333336 | 20.72 |
| 44709.25 | 20.747 |
| 44709.260416666664 | 20.764 |
| 44709.270833333336 | 20.762 |
| 44709.28125 | 20.722 |
| 44709.291666666664 | 20.685 |
| 44709.302083333336 | 20.67 |
| 44709.3125 | 20.644 |
| 44709.322916666664 | 20.598 |
| 44709.333333333336 | 20.528 |
| 44709.34375 | 20.435 |
| 44709.354166666664 | 20.307 |
| 44709.364583333336 | 20.215 |
| 44709.375 | 20.185 |
| 44709.385416666664 | 20.12 |
| 44709.395833333336 | 20.063 |
| 44709.40625 | 20.016 |
| 44709.416666666664 | 19.968 |
| 44709.427083333336 | 19.924 |
| 44709.4375 | 19.878 |
| 44709.447916666664 | 19.838 |
| 44709.458333333336 | 19.807 |
| 44709.46875 | 19.782 |
| 44709.479166666664 | 19.711 |
| 44709.489583333336 | 19.628 |
| 44709.5 | 19.584 |
| 44709.510416666664 | 19.558 |
| 44709.520833333336 | 19.449 |
| 44709.53125 | 19.623 |
| 44709.541666666664 | 19.739 |
| 44709.552083333336 | 19.865 |
| 44709.5625 | 19.987 |
| 44709.572916666664 | 20.166 |
| 44709.583333333336 | 20.428 |
| 44709.59375 | 20.528 |
| 44709.604166666664 | 20.913 |
| 44709.614583333336 | 20.93 |
| 44709.625 | 21.045 |
| 44709.635416666664 | 21.189 |
| 44709.645833333336 | 21.549 |
| 44709.65625 | 21.81 |
| 44709.666666666664 | 22.025 |
| 44709.677083333336 | 22.244 |
| 44709.6875 | 22.488 |
| 44709.697916666664 | 22.728 |
| 44709.708333333336 | 22.869 |
| 44709.71875 | 23.138 |
| 44709.729166666664 | 23.388 |
| 44709.739583333336 | 23.596 |
| 44709.75 | 23.738 |
| 44709.760416666664 | 23.812 |
| 44709.770833333336 | 23.824 |
| 44709.78125 | 23.373 |
| 44709.791666666664 | 23.36 |
| 44709.802083333336 | 23.22 |
| 44709.8125 | 22.985 |
| 44709.822916666664 | 22.789 |
| 44709.833333333336 | 22.715 |
| 44709.84375 | 22.955 |
| 44709.854166666664 | 23.062 |
| 44709.864583333336 | 23.171 |
| 44709.875 | 23.308 |
| 44709.885416666664 | 23.383 |
| 44709.895833333336 | 23.416 |
| 44709.90625 | 23.422 |
| 44709.916666666664 | 23.369 |
| 44709.927083333336 | 23.233 |
| 44709.9375 | 23.044 |
| 44709.947916666664 | 22.811 |
| 44709.958333333336 | 22.654 |
| 44709.96875 | 22.525 |
| 44709.979166666664 | 22.401 |
| 44709.989583333336 | 22.292 |
| 44710.0 | 22.204 |
| 44710.010416666664 | 22.147 |
| 44710.020833333336 | 22.086 |
| 44710.03125 | 22.032 |
| 44710.041666666664 | 22.016 |
| 44710.052083333336 | 22.224 |
| 44710.0625 | 22.163 |
| 44710.072916666664 | 22.176 |
| 44710.083333333336 | 22.306 |
| 44710.09375 | 22.259 |
| 44710.104166666664 | 22.367 |
| 44710.114583333336 | 22.378 |
| 44710.125 | 22.545 |
| 44710.135416666664 | 22.657 |
| 44710.145833333336 | 22.74 |
| 44710.15625 | 22.963 |
| 44710.166666666664 | 23.042 |
| 44710.177083333336 | 23.041 |
| 44710.1875 | 23.149 |
| 44710.197916666664 | 23.228 |
| 44710.208333333336 | 23.36 |
| 44710.21875 | 23.42 |
| 44710.229166666664 | 23.482 |
| 44710.239583333336 | 23.488 |
| 44710.25 | 23.491 |
| 44710.260416666664 | 23.495 |
| 44710.270833333336 | 23.44 |
| 44710.28125 | 23.434 |
| 44710.291666666664 | 23.417 |
| 44710.302083333336 | 23.385 |
| 44710.3125 | 23.304 |
| 44710.322916666664 | 23.284 |
| 44710.333333333336 | 23.297 |
| 44710.34375 | 23.251 |
| 44710.354166666664 | 23.154 |
| 44710.364583333336 | 22.854 |
| 44710.375 | 22.571 |
| 44710.385416666664 | 22.276 |
| 44710.395833333336 | 22.054 |
| 44710.40625 | 21.892 |
| 44710.416666666664 | 21.793 |
| 44710.427083333336 | 21.711 |
| 44710.4375 | 21.624 |
| 44710.447916666664 | 21.506 |
| 44710.458333333336 | 21.419 |
| 44710.46875 | 21.308 |
| 44710.479166666664 | 21.153 |
| 44710.489583333336 | 21.019 |
| 44710.5 | 20.941 |
| 44710.510416666664 | 20.893 |
| 44710.520833333336 | 20.89 |
| 44710.53125 | 20.871 |
| 44710.541666666664 | 20.746 |
| 44710.552083333336 | 20.794 |
| 44710.5625 | 21.123 |
| 44710.572916666664 | 21.199 |
| 44710.583333333336 | 21.678 |
| 44710.59375 | 21.853 |
| 44710.604166666664 | 22.328 |
| 44710.614583333336 | 22.612 |
| 44710.625 | 23.393 |
| 44710.635416666664 | 23.606 |
| 44710.645833333336 | 23.956 |
| 44710.65625 | 23.805 |
| 44710.666666666664 | 23.795 |
| 44710.677083333336 | 24.003 |
| 44710.6875 | 24.317 |
| 44710.697916666664 | 24.574 |
| 44710.708333333336 | 24.886 |
| 44710.71875 | 24.884 |
| 44710.729166666664 | 25.244 |
| 44710.739583333336 | 25.551 |
| 44710.75 | 25.71 |
| 44710.760416666664 | 25.798 |
| 44710.770833333336 | 25.961 |
| 44710.78125 | 26.113 |
| 44710.791666666664 | 26.074 |
| 44710.802083333336 | 26.094 |
| 44710.8125 | 25.874 |
| 44710.822916666664 | 25.684 |
| 44710.833333333336 | 25.534 |
| 44710.84375 | 25.393 |
| 44710.854166666664 | 25.327 |
| 44710.864583333336 | 25.303 |
| 44710.875 | 25.316 |
| 44710.885416666664 | 25.284 |
| 44710.895833333336 | 25.218 |
| 44710.90625 | 25.139 |
| 44710.916666666664 | 25.085 |
| 44710.927083333336 | 24.949 |
| 44710.9375 | 24.857 |
| 44710.947916666664 | 24.741 |
| 44710.958333333336 | 24.615 |
| 44710.96875 | 24.455 |
| 44710.979166666664 | 24.282 |
| 44710.989583333336 | 24.09 |
| 44711.0 | 24 |
| 44711.010416666664 | 23.886 |
| 44711.020833333336 | 23.755 |
| 44711.03125 | 23.656 |
| 44711.041666666664 | 23.583 |
| 44711.052083333336 | 23.561 |
| 44711.0625 | 23.493 |
| 44711.072916666664 | 23.565 |
| 44711.083333333336 | 23.749 |
| 44711.09375 | 23.625 |
| 44711.104166666664 | 23.77 |
| 44711.114583333336 | 23.641 |
| 44711.125 | 23.735 |
| 44711.135416666664 | 23.74 |
| 44711.145833333336 | 23.77 |
| 44711.15625 | 23.795 |
| 44711.166666666664 | 23.816 |
| 44711.177083333336 | 23.868 |
| 44711.1875 | 23.949 |
| 44711.197916666664 | 24.002 |
| 44711.208333333336 | 24.182 |
| 44711.21875 | 24.329 |
| 44711.229166666664 | 24.427 |
| 44711.239583333336 | 24.571 |
| 44711.25 | 24.631 |
| 44711.260416666664 | 24.678 |
| 44711.270833333336 | 24.729 |
| 44711.28125 | 24.754 |
| 44711.291666666664 | 24.74 |
| 44711.302083333336 | 24.738 |
| 44711.3125 | 24.712 |
| 44711.322916666664 | 24.714 |
| 44711.333333333336 | 24.63 |
| 44711.34375 | 24.565 |
| 44711.354166666664 | 24.577 |
| 44711.364583333336 | 24.561 |
| 44711.375 | 24.495 |
| 44711.385416666664 | 24.373 |
| 44711.395833333336 | 24.054 |
| 44711.40625 | 23.804 |
| 44711.416666666664 | 23.646 |
| 44711.427083333336 | 23.518 |
| 44711.4375 | 23.431 |
| 44711.447916666664 | 23.343 |
| 44711.458333333336 | 23.251 |
| 44711.46875 | 23.179 |
| 44711.479166666664 | 23.094 |
| 44711.489583333336 | 23.011 |
| 44711.5 | 22.955 |
| 44711.510416666664 | 22.896 |
| 44711.520833333336 | 22.855 |
| 44711.53125 | 22.837 |
| 44711.541666666664 | 22.806 |
| 44711.552083333336 | 22.781 |
| 44711.5625 | 22.827 |
| 44711.572916666664 | 22.957 |
| 44711.583333333336 | 22.836 |
| 44711.59375 | 23.337 |
| 44711.604166666664 | 23.66 |
| 44711.614583333336 | 24.017 |
| 44711.625 | 24.455 |
| 44711.635416666664 | 24.794 |
| 44711.645833333336 | 25.439 |
| 44711.65625 | 25.86 |
| 44711.666666666664 | 25.803 |
| 44711.677083333336 | 25.938 |
| 44711.6875 | 25.782 |
| 44711.697916666664 | 25.495 |
| 44711.708333333336 | 25.786 |
| 44711.71875 | 26.189 |
| 44711.729166666664 | 26.422 |
| 44711.739583333336 | 26.697 |
| 44711.75 | 26.972 |
| 44711.760416666664 | 27.187 |
| 44711.770833333336 | 27.359 |
| 44711.78125 | 27.567 |
| 44711.791666666664 | 27.678 |
| 44711.802083333336 | 27.766 |
| 44711.8125 | 27.78 |
| 44711.822916666664 | 27.774 |
| 44711.833333333336 | 27.616 |
| 44711.84375 | 27.476 |
| 44711.854166666664 | 27.241 |
| 44711.864583333336 | 27.109 |
| 44711.875 | 26.973 |
| 44711.885416666664 | 26.805 |
| 44711.895833333336 | 26.677 |
| 44711.90625 | 26.677 |
| 44711.916666666664 | 26.637 |
| 44711.927083333336 | 26.605 |
| 44711.9375 | 26.56 |
| 44711.947916666664 | 26.471 |
| 44711.958333333336 | 26.447 |
| 44711.96875 | 26.385 |
| 44711.979166666664 | 26.275 |
| 44711.989583333336 | 26.192 |
| 44712.0 | 26.071 |
| 44712.010416666664 | 25.9 |
| 44712.020833333336 | 25.725 |
| 44712.03125 | 25.573 |
| 44712.041666666664 | 25.466 |
| 44712.052083333336 | 25.353 |
| 44712.0625 | 25.249 |
| 44712.072916666664 | 25.153 |
| 44712.083333333336 | 25.101 |
| 44712.09375 | 25.137 |
| 44712.104166666664 | 25.313 |
| 44712.114583333336 | 25.217 |
| 44712.125 | 25.156 |
| 44712.135416666664 | 24.987 |
| 44712.145833333336 | 25.056 |
| 44712.15625 | 25.041 |
| 44712.166666666664 | 25.005 |
| 44712.177083333336 | 24.846 |
| 44712.1875 | 24.76 |
| 44712.197916666664 | 24.7 |
| 44712.208333333336 | 24.802 |
| 44712.21875 | 24.809 |
| 44712.229166666664 | 25.085 |
| 44712.239583333336 | 25.118 |
| 44712.25 | 25.195 |
| 44712.260416666664 | 25.254 |
| 44712.270833333336 | 25.275 |
| 44712.28125 | 25.303 |
| 44712.291666666664 | 25.33 |
| 44712.302083333336 | 25.325 |
| 44712.3125 | 25.347 |
| 44712.322916666664 | 25.308 |
| 44712.333333333336 | 25.292 |
| 44712.34375 | 25.295 |
| 44712.354166666664 | 25.278 |
| 44712.364583333336 | 25.192 |
| 44712.375 | 25.196 |
| 44712.385416666664 | 25.201 |
| 44712.395833333336 | 25.152 |
| 44712.40625 | 25.103 |
| 44712.416666666664 | 24.975 |
| 44712.427083333336 | 24.777 |
| 44712.4375 | 24.632 |
| 44712.447916666664 | 24.509 |
| 44712.458333333336 | 24.432 |
| 44712.46875 | 24.333 |
| 44712.479166666664 | 24.273 |
| 44712.489583333336 | 24.202 |
| 44712.5 | 24.154 |
| 44712.510416666664 | 24.107 |
| 44712.520833333336 | 24.076 |
| 44712.53125 | 24.059 |
| 44712.541666666664 | 24.068 |
| 44712.552083333336 | 24.072 |
| 44712.5625 | 24.083 |
| 44712.572916666664 | 24.107 |
| 44712.583333333336 | 24.145 |
| 44712.59375 | 24.17 |
| 44712.604166666664 | 24.205 |
| 44712.614583333336 | 24.288 |
| 44712.625 | 24.636 |
| 44712.635416666664 | 24.665 |
| 44712.645833333336 | 25.472 |
| 44712.65625 | 25.754 |
| 44712.666666666664 | 26.048 |
| 44712.677083333336 | 26.186 |
| 44712.6875 | 26.634 |
| 44712.697916666664 | 26.313 |
| 44712.708333333336 | 26.449 |
| 44712.71875 | 26.699 |
| 44712.729166666664 | 27.252 |
| 44712.739583333336 | 27.602 |
| 44712.75 | 27.871 |
| 44712.760416666664 | 28.059 |
| 44712.770833333336 | 28.3 |
| 44712.78125 | 28.593 |
| 44712.791666666664 | 28.855 |
| 44712.802083333336 | 29.079 |
| 44712.8125 | 29.296 |
| 44712.822916666664 | 29.272 |
| 44712.833333333336 | 29.382 |
| 44712.84375 | 29.513 |
| 44712.854166666664 | 29.155 |
| 44712.864583333336 | 28.751 |
| 44712.875 | 28.655 |
| 44712.885416666664 | 28.499 |
| 44712.895833333336 | 28.495 |
| 44712.90625 | 28.431 |
| 44712.916666666664 | 28.166 |
| 44712.927083333336 | 27.759 |
| 44712.9375 | 27.698 |
| 44712.947916666664 | 27.827 |
| 44712.958333333336 | 27.728 |
| 44712.96875 | 27.721 |
| 44712.979166666664 | 27.711 |
| 44712.989583333336 | 27.671 |
| 44713.0 | 27.628 |
| 44713.010416666664 | 27.539 |
| 44713.020833333336 | 27.419 |
| 44713.03125 | 27.271 |
| 44713.041666666664 | 27.115 |
| 44713.052083333336 | 27.005 |
| 44713.0625 | 26.854 |
| 44713.072916666664 | 26.73 |
| 44713.083333333336 | 26.611 |
| 44713.09375 | 26.542 |
| 44713.104166666664 | 26.501 |
| 44713.114583333336 | 26.478 |
| 44713.125 | 26.279 |
| 44713.135416666664 | 26.424 |
| 44713.145833333336 | 26.423 |
| 44713.15625 | 26.509 |